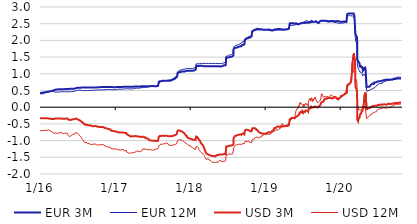
| Category | EUR 3M | EUR 12M | USD 3M | USD 12M |
|---|---|---|---|---|
| 2016-01-04 | 0.422 | 0.402 | -0.322 | -0.709 |
| 2016-01-05 | 0.423 | 0.401 | -0.327 | -0.713 |
| 2016-01-06 | 0.426 | 0.404 | -0.33 | -0.705 |
| 2016-01-07 | 0.432 | 0.409 | -0.327 | -0.687 |
| 2016-01-08 | 0.433 | 0.409 | -0.331 | -0.695 |
| 2016-01-11 | 0.433 | 0.4 | -0.332 | -0.704 |
| 2016-01-12 | 0.434 | 0.402 | -0.334 | -0.706 |
| 2016-01-13 | 0.434 | 0.401 | -0.332 | -0.713 |
| 2016-01-14 | 0.433 | 0.402 | -0.331 | -0.709 |
| 2016-01-15 | 0.432 | 0.401 | -0.33 | -0.695 |
| 2016-01-18 | 0.432 | 0.401 | -0.33 | -0.695 |
| 2016-01-19 | 0.432 | 0.401 | -0.33 | -0.695 |
| 2016-01-20 | 0.432 | 0.401 | -0.33 | -0.695 |
| 2016-01-21 | 0.432 | 0.401 | -0.33 | -0.695 |
| 2016-01-22 | 0.432 | 0.401 | -0.33 | -0.695 |
| 2016-01-25 | 0.445 | 0.422 | -0.331 | -0.703 |
| 2016-01-26 | 0.448 | 0.425 | -0.331 | -0.701 |
| 2016-01-27 | 0.449 | 0.428 | -0.328 | -0.7 |
| 2016-01-28 | 0.45 | 0.428 | -0.326 | -0.701 |
| 2016-01-29 | 0.452 | 0.435 | -0.323 | -0.69 |
| 2016-02-01 | 0.452 | 0.44 | -0.329 | -0.69 |
| 2016-02-02 | 0.451 | 0.441 | -0.329 | -0.688 |
| 2016-02-03 | 0.452 | 0.442 | -0.331 | -0.68 |
| 2016-02-04 | 0.456 | 0.448 | -0.33 | -0.679 |
| 2016-02-05 | 0.457 | 0.452 | -0.33 | -0.686 |
| 2016-02-08 | 0.459 | 0.455 | -0.331 | -0.69 |
| 2016-02-09 | 0.451 | 0.454 | -0.34 | -0.681 |
| 2016-02-10 | 0.455 | 0.451 | -0.338 | -0.684 |
| 2016-02-11 | 0.459 | 0.456 | -0.337 | -0.667 |
| 2016-02-12 | 0.463 | 0.459 | -0.338 | -0.666 |
| 2016-02-15 | 0.463 | 0.458 | -0.338 | -0.678 |
| 2016-02-16 | 0.467 | 0.462 | -0.338 | -0.682 |
| 2016-02-17 | 0.469 | 0.461 | -0.339 | -0.685 |
| 2016-02-18 | 0.475 | 0.464 | -0.338 | -0.692 |
| 2016-02-19 | 0.478 | 0.467 | -0.338 | -0.69 |
| 2016-02-22 | 0.479 | 0.468 | -0.345 | -0.709 |
| 2016-02-23 | 0.48 | 0.466 | -0.349 | -0.707 |
| 2016-02-24 | 0.481 | 0.465 | -0.355 | -0.705 |
| 2016-02-25 | 0.481 | 0.465 | -0.356 | -0.71 |
| 2016-02-26 | 0.482 | 0.467 | -0.355 | -0.711 |
| 2016-02-29 | 0.485 | 0.474 | -0.353 | -0.729 |
| 2016-03-01 | 0.487 | 0.476 | -0.352 | -0.729 |
| 2016-03-02 | 0.488 | 0.474 | -0.355 | -0.746 |
| 2016-03-03 | 0.493 | 0.475 | -0.356 | -0.75 |
| 2016-03-04 | 0.495 | 0.478 | -0.353 | -0.744 |
| 2016-03-07 | 0.496 | 0.474 | -0.356 | -0.762 |
| 2016-03-08 | 0.501 | 0.475 | -0.355 | -0.757 |
| 2016-03-09 | 0.504 | 0.473 | -0.355 | -0.759 |
| 2016-03-10 | 0.509 | 0.475 | -0.352 | -0.761 |
| 2016-03-11 | 0.515 | 0.459 | -0.344 | -0.774 |
| 2016-03-14 | 0.516 | 0.458 | -0.35 | -0.781 |
| 2016-03-15 | 0.517 | 0.456 | -0.352 | -0.787 |
| 2016-03-16 | 0.52 | 0.454 | -0.349 | -0.795 |
| 2016-03-17 | 0.524 | 0.453 | -0.333 | -0.752 |
| 2016-03-18 | 0.525 | 0.453 | -0.334 | -0.761 |
| 2016-03-21 | 0.528 | 0.452 | -0.335 | -0.764 |
| 2016-03-22 | 0.529 | 0.452 | -0.338 | -0.774 |
| 2016-03-23 | 0.531 | 0.453 | -0.34 | -0.787 |
| 2016-03-24 | 0.532 | 0.455 | -0.339 | -0.781 |
| 2016-03-29 | 0.532 | 0.456 | -0.341 | -0.789 |
| 2016-03-30 | 0.533 | 0.454 | -0.335 | -0.764 |
| 2016-03-31 | 0.534 | 0.455 | -0.339 | -0.76 |
| 2016-04-01 | 0.535 | 0.452 | -0.339 | -0.763 |
| 2016-04-04 | 0.536 | 0.451 | -0.34 | -0.772 |
| 2016-04-05 | 0.538 | 0.454 | -0.337 | -0.755 |
| 2016-04-06 | 0.538 | 0.455 | -0.341 | -0.762 |
| 2016-04-07 | 0.537 | 0.457 | -0.339 | -0.756 |
| 2016-04-08 | 0.538 | 0.46 | -0.341 | -0.755 |
| 2016-04-11 | 0.541 | 0.461 | -0.34 | -0.758 |
| 2016-04-12 | 0.539 | 0.462 | -0.34 | -0.759 |
| 2016-04-13 | 0.539 | 0.463 | -0.338 | -0.768 |
| 2016-04-14 | 0.541 | 0.461 | -0.343 | -0.771 |
| 2016-04-15 | 0.539 | 0.461 | -0.343 | -0.771 |
| 2016-04-18 | 0.539 | 0.462 | -0.344 | -0.768 |
| 2016-04-19 | 0.54 | 0.461 | -0.345 | -0.775 |
| 2016-04-20 | 0.54 | 0.461 | -0.345 | -0.775 |
| 2016-04-21 | 0.54 | 0.461 | -0.345 | -0.775 |
| 2016-04-22 | 0.54 | 0.461 | -0.345 | -0.775 |
| 2016-04-25 | 0.54 | 0.463 | -0.344 | -0.789 |
| 2016-04-26 | 0.542 | 0.464 | -0.344 | -0.793 |
| 2016-04-27 | 0.541 | 0.461 | -0.348 | -0.794 |
| 2016-04-28 | 0.542 | 0.462 | -0.347 | -0.78 |
| 2016-04-29 | 0.541 | 0.462 | -0.347 | -0.78 |
| 2016-05-02 | 0.54 | 0.462 | -0.347 | -0.78 |
| 2016-05-03 | 0.541 | 0.462 | -0.343 | -0.782 |
| 2016-05-04 | 0.543 | 0.462 | -0.344 | -0.78 |
| 2016-05-05 | 0.545 | 0.463 | -0.342 | -0.78 |
| 2016-05-06 | 0.546 | 0.463 | -0.34 | -0.774 |
| 2016-05-09 | 0.548 | 0.464 | -0.34 | -0.777 |
| 2016-05-10 | 0.55 | 0.463 | -0.338 | -0.774 |
| 2016-05-11 | 0.549 | 0.462 | -0.337 | -0.775 |
| 2016-05-12 | 0.548 | 0.462 | -0.336 | -0.777 |
| 2016-05-13 | 0.547 | 0.462 | -0.338 | -0.779 |
| 2016-05-16 | 0.547 | 0.462 | -0.336 | -0.783 |
| 2016-05-17 | 0.547 | 0.461 | -0.335 | -0.792 |
| 2016-05-18 | 0.547 | 0.461 | -0.346 | -0.82 |
| 2016-05-19 | 0.548 | 0.461 | -0.364 | -0.848 |
| 2016-05-20 | 0.548 | 0.461 | -0.371 | -0.852 |
| 2016-05-23 | 0.548 | 0.462 | -0.372 | -0.853 |
| 2016-05-24 | 0.548 | 0.462 | -0.375 | -0.862 |
| 2016-05-25 | 0.548 | 0.463 | -0.377 | -0.873 |
| 2016-05-26 | 0.548 | 0.464 | -0.384 | -0.871 |
| 2016-05-27 | 0.55 | 0.465 | -0.383 | -0.867 |
| 2016-05-30 | 0.551 | 0.465 | -0.383 | -0.867 |
| 2016-05-31 | 0.551 | 0.465 | -0.396 | -0.887 |
| 2016-06-01 | 0.551 | 0.468 | -0.391 | -0.878 |
| 2016-06-02 | 0.552 | 0.467 | -0.39 | -0.882 |
| 2016-06-03 | 0.551 | 0.466 | -0.392 | -0.881 |
| 2016-06-06 | 0.552 | 0.468 | -0.371 | -0.836 |
| 2016-06-07 | 0.551 | 0.468 | -0.367 | -0.835 |
| 2016-06-08 | 0.554 | 0.468 | -0.368 | -0.828 |
| 2016-06-09 | 0.552 | 0.468 | -0.366 | -0.824 |
| 2016-06-10 | 0.553 | 0.468 | -0.366 | -0.824 |
| 2016-06-13 | 0.553 | 0.47 | -0.362 | -0.809 |
| 2016-06-14 | 0.552 | 0.471 | -0.365 | -0.803 |
| 2016-06-15 | 0.552 | 0.471 | -0.366 | -0.815 |
| 2016-06-16 | 0.554 | 0.476 | -0.357 | -0.788 |
| 2016-06-17 | 0.555 | 0.476 | -0.354 | -0.791 |
| 2016-06-20 | 0.556 | 0.478 | -0.356 | -0.802 |
| 2016-06-21 | 0.556 | 0.479 | -0.352 | -0.802 |
| 2016-06-22 | 0.558 | 0.479 | -0.35 | -0.801 |
| 2016-06-23 | 0.559 | 0.479 | -0.35 | -0.8 |
| 2016-06-24 | 0.571 | 0.497 | -0.334 | -0.755 |
| 2016-06-27 | 0.573 | 0.498 | -0.337 | -0.746 |
| 2016-06-28 | 0.571 | 0.499 | -0.341 | -0.755 |
| 2016-06-29 | 0.572 | 0.501 | -0.356 | -0.766 |
| 2016-06-30 | 0.576 | 0.501 | -0.364 | -0.78 |
| 2016-07-01 | 0.58 | 0.502 | -0.363 | -0.775 |
| 2016-07-04 | 0.581 | 0.505 | -0.366 | -0.785 |
| 2016-07-07 | 0.583 | 0.513 | -0.375 | -0.796 |
| 2016-07-08 | 0.583 | 0.509 | -0.377 | -0.803 |
| 2016-07-11 | 0.582 | 0.513 | -0.379 | -0.82 |
| 2016-07-12 | 0.581 | 0.511 | -0.383 | -0.834 |
| 2016-07-13 | 0.585 | 0.511 | -0.39 | -0.843 |
| 2016-07-14 | 0.585 | 0.511 | -0.389 | -0.848 |
| 2016-07-15 | 0.583 | 0.507 | -0.398 | -0.858 |
| 2016-07-18 | 0.585 | 0.511 | -0.406 | -0.876 |
| 2016-07-19 | 0.585 | 0.509 | -0.407 | -0.879 |
| 2016-07-20 | 0.585 | 0.509 | -0.407 | -0.879 |
| 2016-07-21 | 0.585 | 0.509 | -0.407 | -0.879 |
| 2016-07-22 | 0.585 | 0.509 | -0.407 | -0.879 |
| 2016-07-25 | 0.587 | 0.499 | -0.444 | -0.936 |
| 2016-07-26 | 0.588 | 0.498 | -0.453 | -0.949 |
| 2016-07-27 | 0.588 | 0.499 | -0.461 | -0.964 |
| 2016-07-28 | 0.586 | 0.499 | -0.466 | -0.97 |
| 2016-07-29 | 0.587 | 0.499 | -0.469 | -0.982 |
| 2016-08-01 | 0.587 | 0.498 | -0.469 | -0.984 |
| 2016-08-02 | 0.588 | 0.498 | -0.478 | -0.993 |
| 2016-08-03 | 0.589 | 0.497 | -0.488 | -1.005 |
| 2016-08-04 | 0.588 | 0.495 | -0.498 | -1.027 |
| 2016-08-05 | 0.588 | 0.497 | -0.502 | -1.025 |
| 2016-08-08 | 0.588 | 0.496 | -0.516 | -1.058 |
| 2016-08-09 | 0.588 | 0.497 | -0.526 | -1.072 |
| 2016-08-10 | 0.587 | 0.498 | -0.528 | -1.074 |
| 2016-08-11 | 0.589 | 0.499 | -0.527 | -1.07 |
| 2016-08-12 | 0.589 | 0.499 | -0.528 | -1.076 |
| 2016-08-15 | 0.588 | 0.5 | -0.514 | -1.057 |
| 2016-08-16 | 0.589 | 0.5 | -0.511 | -1.048 |
| 2016-08-17 | 0.588 | 0.499 | -0.521 | -1.07 |
| 2016-08-18 | 0.589 | 0.498 | -0.521 | -1.065 |
| 2016-08-19 | 0.588 | 0.497 | -0.527 | -1.073 |
| 2016-08-22 | 0.589 | 0.496 | -0.535 | -1.083 |
| 2016-08-23 | 0.588 | 0.497 | -0.535 | -1.081 |
| 2016-08-24 | 0.588 | 0.498 | -0.535 | -1.077 |
| 2016-08-25 | 0.588 | 0.499 | -0.539 | -1.076 |
| 2016-08-26 | 0.588 | 0.5 | -0.543 | -1.087 |
| 2016-08-29 | 0.587 | 0.5 | -0.543 | -1.087 |
| 2016-08-30 | 0.589 | 0.501 | -0.552 | -1.109 |
| 2016-08-31 | 0.589 | 0.502 | -0.549 | -1.107 |
| 2016-09-01 | 0.589 | 0.501 | -0.546 | -1.116 |
| 2016-09-02 | 0.591 | 0.502 | -0.545 | -1.109 |
| 2016-09-05 | 0.591 | 0.502 | -0.543 | -1.112 |
| 2016-09-06 | 0.593 | 0.504 | -0.551 | -1.111 |
| 2016-09-07 | 0.593 | 0.509 | -0.544 | -1.089 |
| 2016-09-08 | 0.594 | 0.51 | -0.555 | -1.09 |
| 2016-09-09 | 0.591 | 0.507 | -0.562 | -1.107 |
| 2016-09-12 | 0.593 | 0.507 | -0.566 | -1.116 |
| 2016-09-13 | 0.592 | 0.505 | -0.56 | -1.104 |
| 2016-09-14 | 0.593 | 0.504 | -0.564 | -1.106 |
| 2016-09-15 | 0.591 | 0.503 | -0.567 | -1.1 |
| 2016-09-16 | 0.591 | 0.504 | -0.567 | -1.095 |
| 2016-09-19 | 0.591 | 0.506 | -0.571 | -1.106 |
| 2016-09-20 | 0.591 | 0.507 | -0.576 | -1.115 |
| 2016-09-21 | 0.591 | 0.508 | -0.573 | -1.121 |
| 2016-09-22 | 0.591 | 0.509 | -0.567 | -1.111 |
| 2016-09-23 | 0.592 | 0.509 | -0.563 | -1.107 |
| 2016-09-26 | 0.593 | 0.51 | -0.563 | -1.105 |
| 2016-09-27 | 0.591 | 0.51 | -0.564 | -1.101 |
| 2016-09-29 | 0.591 | 0.514 | -0.556 | -1.106 |
| 2016-09-30 | 0.591 | 0.514 | -0.564 | -1.102 |
| 2016-10-03 | 0.591 | 0.514 | -0.568 | -1.109 |
| 2016-10-04 | 0.591 | 0.514 | -0.574 | -1.116 |
| 2016-10-05 | 0.592 | 0.514 | -0.578 | -1.123 |
| 2016-10-06 | 0.594 | 0.514 | -0.582 | -1.131 |
| 2016-10-07 | 0.594 | 0.513 | -0.586 | -1.137 |
| 2016-10-10 | 0.595 | 0.514 | -0.584 | -1.136 |
| 2016-10-11 | 0.596 | 0.516 | -0.587 | -1.141 |
| 2016-10-12 | 0.599 | 0.519 | -0.591 | -1.146 |
| 2016-10-13 | 0.601 | 0.521 | -0.59 | -1.137 |
| 2016-10-14 | 0.601 | 0.522 | -0.592 | -1.136 |
| 2016-10-17 | 0.601 | 0.521 | -0.588 | -1.131 |
| 2016-10-18 | 0.602 | 0.523 | -0.591 | -1.121 |
| 2016-10-19 | 0.603 | 0.523 | -0.591 | -1.114 |
| 2016-10-20 | 0.603 | 0.523 | -0.592 | -1.116 |
| 2016-10-21 | 0.602 | 0.524 | -0.592 | -1.122 |
| 2016-10-24 | 0.601 | 0.52 | -0.594 | -1.121 |
| 2016-10-25 | 0.602 | 0.521 | -0.596 | -1.128 |
| 2016-10-26 | 0.603 | 0.52 | -0.6 | -1.13 |
| 2016-10-27 | 0.602 | 0.52 | -0.597 | -1.132 |
| 2016-10-31 | 0.603 | 0.519 | -0.594 | -1.125 |
| 2016-11-01 | 0.603 | 0.519 | -0.591 | -1.126 |
| 2016-11-02 | 0.603 | 0.521 | -0.586 | -1.115 |
| 2016-11-03 | 0.603 | 0.521 | -0.591 | -1.11 |
| 2016-11-04 | 0.602 | 0.521 | -0.593 | -1.109 |
| 2016-11-07 | 0.602 | 0.52 | -0.597 | -1.118 |
| 2016-11-08 | 0.602 | 0.52 | -0.592 | -1.118 |
| 2016-11-09 | 0.602 | 0.52 | -0.596 | -1.106 |
| 2016-11-10 | 0.602 | 0.521 | -0.612 | -1.133 |
| 2016-11-11 | 0.602 | 0.519 | -0.616 | -1.138 |
| 2016-11-14 | 0.602 | 0.52 | -0.621 | -1.16 |
| 2016-11-15 | 0.602 | 0.521 | -0.616 | -1.155 |
| 2016-11-16 | 0.601 | 0.523 | -0.619 | -1.162 |
| 2016-11-18 | 0.603 | 0.527 | -0.626 | -1.171 |
| 2016-11-21 | 0.602 | 0.528 | -0.63 | -1.173 |
| 2016-11-22 | 0.603 | 0.529 | -0.635 | -1.178 |
| 2016-11-23 | 0.603 | 0.528 | -0.64 | -1.18 |
| 2016-11-24 | 0.604 | 0.529 | -0.647 | -1.193 |
| 2016-11-25 | 0.604 | 0.529 | -0.647 | -1.195 |
| 2016-11-28 | 0.604 | 0.529 | -0.645 | -1.191 |
| 2016-11-29 | 0.604 | 0.529 | -0.641 | -1.191 |
| 2016-11-30 | 0.604 | 0.53 | -0.644 | -1.189 |
| 2016-12-01 | 0.603 | 0.529 | -0.652 | -1.193 |
| 2016-12-02 | 0.603 | 0.526 | -0.656 | -1.195 |
| 2016-12-05 | 0.603 | 0.528 | -0.658 | -1.194 |
| 2016-12-06 | 0.605 | 0.529 | -0.661 | -1.196 |
| 2016-12-07 | 0.606 | 0.528 | -0.661 | -1.195 |
| 2016-12-08 | 0.608 | 0.528 | -0.663 | -1.195 |
| 2016-12-09 | 0.606 | 0.531 | -0.667 | -1.198 |
| 2016-12-12 | 0.606 | 0.531 | -0.669 | -1.205 |
| 2016-12-13 | 0.606 | 0.531 | -0.673 | -1.204 |
| 2016-12-14 | 0.606 | 0.532 | -0.68 | -1.205 |
| 2016-12-15 | 0.606 | 0.531 | -0.703 | -1.25 |
| 2016-12-16 | 0.604 | 0.531 | -0.707 | -1.243 |
| 2016-12-19 | 0.603 | 0.521 | -0.704 | -1.252 |
| 2016-12-20 | 0.603 | 0.521 | -0.706 | -1.251 |
| 2016-12-21 | 0.605 | 0.522 | -0.708 | -1.25 |
| 2016-12-22 | 0.596 | 0.522 | -0.717 | -1.248 |
| 2016-12-23 | 0.597 | 0.522 | -0.717 | -1.25 |
| 2016-12-27 | 0.598 | 0.521 | -0.717 | -1.25 |
| 2016-12-28 | 0.589 | 0.512 | -0.728 | -1.26 |
| 2016-12-29 | 0.599 | 0.521 | -0.718 | -1.247 |
| 2016-12-30 | 0.599 | 0.522 | -0.718 | -1.246 |
| 2017-01-02 | 0.598 | 0.523 | -0.718 | -1.246 |
| 2017-01-03 | 0.599 | 0.524 | -0.719 | -1.249 |
| 2017-01-04 | 0.6 | 0.525 | -0.725 | -1.249 |
| 2017-01-05 | 0.601 | 0.525 | -0.729 | -1.249 |
| 2017-01-06 | 0.601 | 0.527 | -0.73 | -1.245 |
| 2017-01-09 | 0.602 | 0.528 | -0.735 | -1.261 |
| 2017-01-10 | 0.604 | 0.53 | -0.738 | -1.262 |
| 2017-01-11 | 0.606 | 0.531 | -0.742 | -1.263 |
| 2017-01-12 | 0.607 | 0.533 | -0.742 | -1.258 |
| 2017-01-13 | 0.607 | 0.534 | -0.743 | -1.258 |
| 2017-01-16 | 0.608 | 0.535 | -0.744 | -1.262 |
| 2017-01-17 | 0.609 | 0.538 | -0.745 | -1.262 |
| 2017-01-18 | 0.609 | 0.539 | -0.75 | -1.27 |
| 2017-01-19 | 0.609 | 0.54 | -0.761 | -1.288 |
| 2017-01-20 | 0.609 | 0.54 | -0.761 | -1.288 |
| 2017-01-23 | 0.607 | 0.541 | -0.758 | -1.281 |
| 2017-01-24 | 0.608 | 0.541 | -0.752 | -1.267 |
| 2017-01-25 | 0.608 | 0.541 | -0.757 | -1.279 |
| 2017-01-26 | 0.608 | 0.542 | -0.759 | -1.288 |
| 2017-01-27 | 0.608 | 0.541 | -0.759 | -1.284 |
| 2017-01-30 | 0.608 | 0.54 | -0.754 | -1.285 |
| 2017-01-31 | 0.607 | 0.541 | -0.755 | -1.273 |
| 2017-02-01 | 0.608 | 0.543 | -0.755 | -1.275 |
| 2017-02-02 | 0.608 | 0.542 | -0.754 | -1.272 |
| 2017-02-03 | 0.608 | 0.541 | -0.754 | -1.273 |
| 2017-02-06 | 0.608 | 0.541 | -0.758 | -1.267 |
| 2017-02-07 | 0.608 | 0.541 | -0.758 | -1.265 |
| 2017-02-08 | 0.608 | 0.541 | -0.754 | -1.26 |
| 2017-02-09 | 0.608 | 0.541 | -0.754 | -1.254 |
| 2017-02-10 | 0.609 | 0.541 | -0.756 | -1.263 |
| 2017-02-13 | 0.609 | 0.542 | -0.759 | -1.27 |
| 2017-02-14 | 0.608 | 0.544 | -0.757 | -1.268 |
| 2017-02-15 | 0.608 | 0.544 | -0.762 | -1.284 |
| 2017-02-16 | 0.608 | 0.546 | -0.776 | -1.305 |
| 2017-02-17 | 0.609 | 0.549 | -0.772 | -1.295 |
| 2017-02-20 | 0.609 | 0.549 | -0.77 | -1.295 |
| 2017-02-21 | 0.609 | 0.551 | -0.773 | -1.305 |
| 2017-02-22 | 0.61 | 0.551 | -0.774 | -1.306 |
| 2017-02-23 | 0.609 | 0.551 | -0.772 | -1.304 |
| 2017-02-24 | 0.609 | 0.553 | -0.774 | -1.3 |
| 2017-02-27 | 0.609 | 0.553 | -0.775 | -1.3 |
| 2017-02-28 | 0.61 | 0.554 | -0.784 | -1.316 |
| 2017-03-01 | 0.609 | 0.554 | -0.813 | -1.35 |
| 2017-03-02 | 0.609 | 0.554 | -0.82 | -1.358 |
| 2017-03-03 | 0.609 | 0.553 | -0.822 | -1.368 |
| 2017-03-06 | 0.609 | 0.551 | -0.826 | -1.36 |
| 2017-03-07 | 0.608 | 0.551 | -0.826 | -1.36 |
| 2017-03-08 | 0.609 | 0.551 | -0.829 | -1.361 |
| 2017-03-09 | 0.609 | 0.551 | -0.84 | -1.374 |
| 2017-03-10 | 0.609 | 0.549 | -0.841 | -1.378 |
| 2017-03-13 | 0.61 | 0.548 | -0.851 | -1.381 |
| 2017-03-14 | 0.61 | 0.548 | -0.857 | -1.383 |
| 2017-03-15 | 0.609 | 0.55 | -0.868 | -1.388 |
| 2017-03-16 | 0.609 | 0.551 | -0.872 | -1.374 |
| 2017-03-17 | 0.609 | 0.549 | -0.872 | -1.373 |
| 2017-03-20 | 0.609 | 0.549 | -0.876 | -1.376 |
| 2017-03-21 | 0.609 | 0.546 | -0.876 | -1.375 |
| 2017-03-22 | 0.61 | 0.546 | -0.877 | -1.367 |
| 2017-03-23 | 0.61 | 0.547 | -0.873 | -1.364 |
| 2017-03-24 | 0.61 | 0.547 | -0.871 | -1.363 |
| 2017-03-27 | 0.61 | 0.549 | -0.872 | -1.357 |
| 2017-03-28 | 0.61 | 0.55 | -0.872 | -1.358 |
| 2017-03-29 | 0.61 | 0.549 | -0.867 | -1.354 |
| 2017-03-30 | 0.61 | 0.549 | -0.868 | -1.353 |
| 2017-03-31 | 0.609 | 0.549 | -0.87 | -1.362 |
| 2017-04-03 | 0.61 | 0.551 | -0.87 | -1.363 |
| 2017-04-04 | 0.61 | 0.551 | -0.87 | -1.352 |
| 2017-04-05 | 0.609 | 0.554 | -0.87 | -1.356 |
| 2017-04-06 | 0.61 | 0.555 | -0.875 | -1.358 |
| 2017-04-07 | 0.62 | 0.556 | -0.868 | -1.359 |
| 2017-04-10 | 0.622 | 0.568 | -0.866 | -1.348 |
| 2017-04-11 | 0.622 | 0.569 | -0.865 | -1.339 |
| 2017-04-12 | 0.622 | 0.57 | -0.868 | -1.333 |
| 2017-04-13 | 0.621 | 0.57 | -0.868 | -1.322 |
| 2017-04-18 | 0.621 | 0.572 | -0.866 | -1.311 |
| 2017-04-19 | 0.622 | 0.573 | -0.866 | -1.286 |
| 2017-04-20 | 0.622 | 0.574 | -0.863 | -1.289 |
| 2017-04-21 | 0.621 | 0.574 | -0.866 | -1.295 |
| 2017-04-24 | 0.619 | 0.571 | -0.876 | -1.318 |
| 2017-04-25 | 0.619 | 0.571 | -0.88 | -1.325 |
| 2017-04-26 | 0.619 | 0.571 | -0.882 | -1.333 |
| 2017-04-27 | 0.619 | 0.571 | -0.88 | -1.326 |
| 2017-04-28 | 0.619 | 0.571 | -0.882 | -1.324 |
| 2017-05-02 | 0.619 | 0.571 | -0.884 | -1.33 |
| 2017-05-03 | 0.619 | 0.575 | -0.881 | -1.32 |
| 2017-05-04 | 0.619 | 0.576 | -0.889 | -1.331 |
| 2017-05-05 | 0.619 | 0.574 | -0.89 | -1.329 |
| 2017-05-09 | 0.619 | 0.583 | -0.892 | -1.331 |
| 2017-05-10 | 0.619 | 0.584 | -0.891 | -1.328 |
| 2017-05-11 | 0.629 | 0.584 | -0.882 | -1.326 |
| 2017-05-12 | 0.629 | 0.587 | -0.88 | -1.306 |
| 2017-05-15 | 0.63 | 0.587 | -0.879 | -1.285 |
| 2017-05-16 | 0.631 | 0.588 | -0.881 | -1.285 |
| 2017-05-17 | 0.631 | 0.589 | -0.878 | -1.273 |
| 2017-05-18 | 0.631 | 0.589 | -0.872 | -1.245 |
| 2017-05-19 | 0.631 | 0.589 | -0.886 | -1.263 |
| 2017-05-22 | 0.629 | 0.589 | -0.892 | -1.266 |
| 2017-05-23 | 0.63 | 0.589 | -0.889 | -1.26 |
| 2017-05-24 | 0.629 | 0.599 | -0.898 | -1.256 |
| 2017-05-25 | 0.629 | 0.599 | -0.9 | -1.253 |
| 2017-05-26 | 0.629 | 0.6 | -0.902 | -1.251 |
| 2017-05-29 | 0.629 | 0.601 | -0.902 | -1.251 |
| 2017-05-30 | 0.629 | 0.591 | -0.902 | -1.262 |
| 2017-05-31 | 0.629 | 0.591 | -0.91 | -1.264 |
| 2017-06-01 | 0.629 | 0.591 | -0.918 | -1.266 |
| 2017-06-02 | 0.619 | 0.591 | -0.932 | -1.271 |
| 2017-06-05 | 0.619 | 0.591 | -0.93 | -1.266 |
| 2017-06-06 | 0.619 | 0.593 | -0.929 | -1.263 |
| 2017-06-07 | 0.619 | 0.594 | -0.931 | -1.264 |
| 2017-06-08 | 0.62 | 0.594 | -0.938 | -1.268 |
| 2017-06-09 | 0.631 | 0.6 | -0.936 | -1.268 |
| 2017-06-12 | 0.631 | 0.607 | -0.942 | -1.276 |
| 2017-06-13 | 0.631 | 0.609 | -0.946 | -1.276 |
| 2017-06-14 | 0.631 | 0.612 | -0.95 | -1.276 |
| 2017-06-15 | 0.629 | 0.612 | -0.967 | -1.27 |
| 2017-06-16 | 0.629 | 0.614 | -0.974 | -1.272 |
| 2017-06-19 | 0.629 | 0.616 | -0.98 | -1.268 |
| 2017-06-20 | 0.629 | 0.619 | -0.987 | -1.276 |
| 2017-06-21 | 0.629 | 0.621 | -0.989 | -1.275 |
| 2017-06-22 | 0.63 | 0.621 | -0.996 | -1.278 |
| 2017-06-23 | 0.631 | 0.623 | -0.993 | -1.273 |
| 2017-06-26 | 0.631 | 0.621 | -0.995 | -1.275 |
| 2017-06-27 | 0.631 | 0.621 | -0.995 | -1.273 |
| 2017-06-28 | 0.631 | 0.618 | -0.996 | -1.277 |
| 2017-06-29 | 0.621 | 0.616 | -1.009 | -1.28 |
| 2017-06-30 | 0.631 | 0.616 | -0.999 | -1.278 |
| 2017-07-03 | 0.631 | 0.617 | -1.001 | -1.288 |
| 2017-07-04 | 0.629 | 0.619 | -1.002 | -1.291 |
| 2017-07-07 | 0.631 | 0.631 | -1.005 | -1.288 |
| 2017-07-10 | 0.631 | 0.626 | -1.004 | -1.281 |
| 2017-07-11 | 0.631 | 0.625 | -1.004 | -1.282 |
| 2017-07-12 | 0.631 | 0.624 | -1.004 | -1.276 |
| 2017-07-13 | 0.631 | 0.621 | -1.004 | -1.268 |
| 2017-07-14 | 0.631 | 0.621 | -1.004 | -1.27 |
| 2017-07-17 | 0.63 | 0.621 | -1.006 | -1.263 |
| 2017-07-18 | 0.631 | 0.621 | -1.007 | -1.263 |
| 2017-07-19 | 0.632 | 0.621 | -1.007 | -1.263 |
| 2017-07-20 | 0.632 | 0.621 | -1.007 | -1.263 |
| 2017-07-21 | 0.632 | 0.621 | -1.007 | -1.263 |
| 2017-07-24 | 0.629 | 0.633 | -1.014 | -1.256 |
| 2017-07-25 | 0.629 | 0.633 | -1.017 | -1.259 |
| 2017-07-26 | 0.63 | 0.633 | -1.014 | -1.256 |
| 2017-07-27 | 0.629 | 0.633 | -1.011 | -1.25 |
| 2017-07-28 | 0.639 | 0.632 | -1.001 | -1.249 |
| 2017-07-31 | 0.64 | 0.641 | -1.001 | -1.237 |
| 2017-08-01 | 0.641 | 0.641 | -1.001 | -1.236 |
| 2017-08-02 | 0.641 | 0.643 | -1.003 | -1.236 |
| 2017-08-03 | 0.639 | 0.642 | -1.002 | -1.236 |
| 2017-08-04 | 0.759 | 0.711 | -0.882 | -1.163 |
| 2017-08-07 | 0.768 | 0.742 | -0.871 | -1.142 |
| 2017-08-08 | 0.768 | 0.752 | -0.869 | -1.13 |
| 2017-08-09 | 0.778 | 0.753 | -0.859 | -1.128 |
| 2017-08-10 | 0.779 | 0.764 | -0.859 | -1.118 |
| 2017-08-11 | 0.779 | 0.766 | -0.865 | -1.115 |
| 2017-08-14 | 0.779 | 0.768 | -0.864 | -1.108 |
| 2017-08-15 | 0.779 | 0.767 | -0.864 | -1.118 |
| 2017-08-16 | 0.779 | 0.777 | -0.867 | -1.116 |
| 2017-08-17 | 0.789 | 0.778 | -0.856 | -1.113 |
| 2017-08-18 | 0.789 | 0.778 | -0.855 | -1.106 |
| 2017-08-21 | 0.789 | 0.778 | -0.854 | -1.107 |
| 2017-08-22 | 0.788 | 0.788 | -0.857 | -1.097 |
| 2017-08-23 | 0.789 | 0.789 | -0.857 | -1.098 |
| 2017-08-24 | 0.789 | 0.789 | -0.857 | -1.093 |
| 2017-08-25 | 0.789 | 0.789 | -0.858 | -1.098 |
| 2017-08-28 | 0.789 | 0.789 | -0.858 | -1.098 |
| 2017-08-29 | 0.79 | 0.79 | -0.857 | -1.084 |
| 2017-08-30 | 0.79 | 0.791 | -0.856 | -1.082 |
| 2017-08-31 | 0.789 | 0.791 | -0.858 | -1.083 |
| 2017-09-01 | 0.789 | 0.791 | -0.856 | -1.082 |
| 2017-09-04 | 0.789 | 0.791 | -0.856 | -1.083 |
| 2017-09-05 | 0.789 | 0.791 | -0.857 | -1.085 |
| 2017-09-06 | 0.789 | 0.793 | -0.857 | -1.078 |
| 2017-09-07 | 0.79 | 0.792 | -0.857 | -1.079 |
| 2017-09-08 | 0.791 | 0.796 | -0.85 | -1.065 |
| 2017-09-11 | 0.791 | 0.798 | -0.857 | -1.069 |
| 2017-09-12 | 0.79 | 0.809 | -0.859 | -1.07 |
| 2017-09-13 | 0.789 | 0.809 | -0.86 | -1.072 |
| 2017-09-14 | 0.789 | 0.811 | -0.861 | -1.08 |
| 2017-09-15 | 0.789 | 0.811 | -0.864 | -1.092 |
| 2017-09-18 | 0.789 | 0.811 | -0.865 | -1.1 |
| 2017-09-19 | 0.79 | 0.811 | -0.866 | -1.104 |
| 2017-09-20 | 0.789 | 0.811 | -0.863 | -1.107 |
| 2017-09-21 | 0.79 | 0.811 | -0.868 | -1.128 |
| 2017-09-22 | 0.789 | 0.811 | -0.869 | -1.135 |
| 2017-09-25 | 0.789 | 0.811 | -0.87 | -1.135 |
| 2017-09-26 | 0.789 | 0.811 | -0.871 | -1.136 |
| 2017-09-27 | 0.799 | 0.811 | -0.863 | -1.145 |
| 2017-09-29 | 0.799 | 0.822 | -0.864 | -1.132 |
| 2017-10-02 | 0.799 | 0.822 | -0.866 | -1.141 |
| 2017-10-03 | 0.8 | 0.821 | -0.872 | -1.149 |
| 2017-10-04 | 0.799 | 0.818 | -0.877 | -1.148 |
| 2017-10-05 | 0.809 | 0.831 | -0.869 | -1.14 |
| 2017-10-06 | 0.819 | 0.833 | -0.86 | -1.145 |
| 2017-10-09 | 0.819 | 0.846 | -0.866 | -1.139 |
| 2017-10-10 | 0.819 | 0.851 | -0.867 | -1.137 |
| 2017-10-11 | 0.819 | 0.841 | -0.869 | -1.15 |
| 2017-10-12 | 0.819 | 0.841 | -0.869 | -1.148 |
| 2017-10-13 | 0.829 | 0.851 | -0.853 | -1.143 |
| 2017-10-16 | 0.839 | 0.862 | -0.844 | -1.13 |
| 2017-10-17 | 0.839 | 0.873 | -0.847 | -1.131 |
| 2017-10-18 | 0.849 | 0.883 | -0.843 | -1.135 |
| 2017-10-19 | 0.849 | 0.893 | -0.842 | -1.118 |
| 2017-10-20 | 0.849 | 0.893 | -0.842 | -1.118 |
| 2017-10-23 | 0.859 | 0.903 | -0.837 | -1.115 |
| 2017-10-24 | 0.87 | 0.903 | -0.831 | -1.115 |
| 2017-10-25 | 0.871 | 0.913 | -0.834 | -1.115 |
| 2017-10-26 | 0.881 | 0.923 | -0.828 | -1.103 |
| 2017-10-27 | 0.891 | 0.924 | -0.82 | -1.108 |
| 2017-10-30 | 0.901 | 0.935 | -0.807 | -1.092 |
| 2017-10-31 | 0.911 | 0.955 | -0.801 | -1.078 |
| 2017-11-01 | 0.919 | 0.957 | -0.795 | -1.086 |
| 2017-11-02 | 0.939 | 0.979 | -0.781 | -1.073 |
| 2017-11-03 | 1.019 | 1.061 | -0.702 | -0.993 |
| 2017-11-06 | 1.029 | 1.081 | -0.697 | -0.974 |
| 2017-11-07 | 1.029 | 1.08 | -0.703 | -0.978 |
| 2017-11-08 | 1.039 | 1.081 | -0.7 | -0.983 |
| 2017-11-09 | 1.049 | 1.091 | -0.693 | -0.982 |
| 2017-11-10 | 1.049 | 1.101 | -0.693 | -0.971 |
| 2017-11-13 | 1.049 | 1.101 | -0.696 | -0.974 |
| 2017-11-14 | 1.049 | 1.111 | -0.699 | -0.973 |
| 2017-11-15 | 1.049 | 1.112 | -0.702 | -0.966 |
| 2017-11-16 | 1.049 | 1.122 | -0.716 | -0.971 |
| 2017-11-20 | 1.059 | 1.117 | -0.716 | -0.978 |
| 2017-11-21 | 1.059 | 1.126 | -0.724 | -0.987 |
| 2017-11-22 | 1.059 | 1.126 | -0.732 | -0.994 |
| 2017-11-23 | 1.059 | 1.126 | -0.732 | -0.99 |
| 2017-11-24 | 1.069 | 1.126 | -0.728 | -0.996 |
| 2017-11-27 | 1.069 | 1.126 | -0.737 | -1.003 |
| 2017-11-28 | 1.069 | 1.126 | -0.739 | -0.998 |
| 2017-11-29 | 1.069 | 1.137 | -0.741 | -0.995 |
| 2017-11-30 | 1.069 | 1.138 | -0.747 | -1.002 |
| 2017-12-01 | 1.066 | 1.128 | -0.755 | -1.02 |
| 2017-12-04 | 1.066 | 1.14 | -0.768 | -1.032 |
| 2017-12-05 | 1.066 | 1.141 | -0.775 | -1.04 |
| 2017-12-06 | 1.066 | 1.141 | -0.783 | -1.038 |
| 2017-12-07 | 1.065 | 1.14 | -0.796 | -1.047 |
| 2017-12-08 | 1.076 | 1.141 | -0.799 | -1.061 |
| 2017-12-11 | 1.077 | 1.141 | -0.813 | -1.064 |
| 2017-12-12 | 1.077 | 1.141 | -0.824 | -1.078 |
| 2017-12-13 | 1.079 | 1.151 | -0.838 | -1.079 |
| 2017-12-14 | 1.091 | 1.162 | -0.84 | -1.069 |
| 2017-12-15 | 1.089 | 1.163 | -0.853 | -1.078 |
| 2017-12-18 | 1.089 | 1.164 | -0.865 | -1.088 |
| 2017-12-19 | 1.089 | 1.164 | -0.882 | -1.099 |
| 2017-12-20 | 1.089 | 1.158 | -0.898 | -1.114 |
| 2017-12-21 | 1.089 | 1.156 | -0.915 | -1.121 |
| 2017-12-22 | 1.089 | 1.156 | -0.926 | -1.132 |
| 2017-12-27 | 1.089 | 1.156 | -0.933 | -1.141 |
| 2017-12-28 | 1.089 | 1.156 | -0.935 | -1.136 |
| 2017-12-29 | 1.089 | 1.156 | -0.934 | -1.137 |
| 2018-01-02 | 1.089 | 1.156 | -0.937 | -1.139 |
| 2018-01-03 | 1.089 | 1.157 | -0.936 | -1.148 |
| 2018-01-04 | 1.089 | 1.157 | -0.944 | -1.168 |
| 2018-01-05 | 1.089 | 1.157 | -0.944 | -1.18 |
| 2018-01-08 | 1.089 | 1.157 | -0.948 | -1.181 |
| 2018-01-09 | 1.089 | 1.157 | -0.945 | -1.176 |
| 2018-01-10 | 1.089 | 1.156 | -0.949 | -1.186 |
| 2018-01-11 | 1.109 | 1.178 | -0.94 | -1.174 |
| 2018-01-12 | 1.089 | 1.156 | -0.962 | -1.203 |
| 2018-01-15 | 1.089 | 1.157 | -0.971 | -1.219 |
| 2018-01-16 | 1.089 | 1.156 | -0.974 | -1.226 |
| 2018-01-17 | 1.098 | 1.166 | -0.969 | -1.234 |
| 2018-01-18 | 1.098 | 1.171 | -0.975 | -1.248 |
| 2018-01-19 | 1.098 | 1.171 | -0.974 | -1.248 |
| 2018-01-22 | 1.098 | 1.171 | -0.971 | -1.248 |
| 2018-01-23 | 1.098 | 1.171 | -0.975 | -1.245 |
| 2018-01-24 | 1.098 | 1.172 | -0.982 | -1.251 |
| 2018-01-25 | 1.108 | 1.182 | -0.972 | -1.241 |
| 2018-01-26 | 1.108 | 1.182 | -0.972 | -1.241 |
| 2018-01-29 | 1.118 | 1.191 | -0.982 | -1.264 |
| 2018-01-30 | 1.138 | 1.201 | -0.963 | -1.253 |
| 2018-01-31 | 1.138 | 1.211 | -0.968 | -1.247 |
| 2018-02-01 | 1.158 | 1.221 | -0.957 | -1.263 |
| 2018-02-02 | 1.239 | 1.301 | -0.879 | -1.181 |
| 2018-02-05 | 1.239 | 1.301 | -0.883 | -1.183 |
| 2018-02-06 | 1.239 | 1.301 | -0.881 | -1.168 |
| 2018-02-07 | 1.239 | 1.301 | -0.89 | -1.176 |
| 2018-02-08 | 1.239 | 1.301 | -0.9 | -1.188 |
| 2018-02-09 | 1.229 | 1.301 | -0.92 | -1.203 |
| 2018-02-12 | 1.229 | 1.301 | -0.933 | -1.209 |
| 2018-02-13 | 1.229 | 1.301 | -0.939 | -1.217 |
| 2018-02-14 | 1.228 | 1.302 | -0.95 | -1.228 |
| 2018-02-15 | 1.228 | 1.301 | -0.972 | -1.271 |
| 2018-02-16 | 1.228 | 1.302 | -0.985 | -1.281 |
| 2018-02-19 | 1.239 | 1.303 | -0.982 | -1.288 |
| 2018-02-20 | 1.239 | 1.303 | -0.994 | -1.298 |
| 2018-02-21 | 1.239 | 1.301 | -1.01 | -1.316 |
| 2018-02-22 | 1.238 | 1.311 | -1.034 | -1.33 |
| 2018-02-23 | 1.238 | 1.311 | -1.046 | -1.34 |
| 2018-02-26 | 1.238 | 1.31 | -1.074 | -1.349 |
| 2018-02-27 | 1.238 | 1.311 | -1.096 | -1.361 |
| 2018-02-28 | 1.237 | 1.311 | -1.107 | -1.382 |
| 2018-03-01 | 1.237 | 1.311 | -1.115 | -1.387 |
| 2018-03-02 | 1.237 | 1.311 | -1.115 | -1.377 |
| 2018-03-05 | 1.237 | 1.311 | -1.125 | -1.378 |
| 2018-03-06 | 1.237 | 1.311 | -1.137 | -1.392 |
| 2018-03-07 | 1.237 | 1.311 | -1.147 | -1.399 |
| 2018-03-08 | 1.237 | 1.311 | -1.161 | -1.413 |
| 2018-03-09 | 1.227 | 1.311 | -1.189 | -1.424 |
| 2018-03-12 | 1.227 | 1.311 | -1.207 | -1.443 |
| 2018-03-13 | 1.227 | 1.311 | -1.224 | -1.458 |
| 2018-03-14 | 1.227 | 1.311 | -1.245 | -1.47 |
| 2018-03-15 | 1.228 | 1.311 | -1.278 | -1.481 |
| 2018-03-16 | 1.228 | 1.312 | -1.302 | -1.494 |
| 2018-03-19 | 1.229 | 1.312 | -1.322 | -1.513 |
| 2018-03-20 | 1.229 | 1.311 | -1.348 | -1.531 |
| 2018-03-21 | 1.229 | 1.311 | -1.371 | -1.556 |
| 2018-03-22 | 1.229 | 1.311 | -1.386 | -1.557 |
| 2018-03-23 | 1.229 | 1.31 | -1.392 | -1.546 |
| 2018-03-26 | 1.229 | 1.311 | -1.395 | -1.552 |
| 2018-03-27 | 1.229 | 1.311 | -1.402 | -1.551 |
| 2018-03-28 | 1.229 | 1.311 | -1.408 | -1.539 |
| 2018-03-29 | 1.228 | 1.31 | -1.412 | -1.543 |
| 2018-04-03 | 1.228 | 1.31 | -1.421 | -1.55 |
| 2018-04-04 | 1.228 | 1.31 | -1.425 | -1.561 |
| 2018-04-05 | 1.228 | 1.311 | -1.431 | -1.58 |
| 2018-04-06 | 1.229 | 1.311 | -1.437 | -1.588 |
| 2018-04-09 | 1.229 | 1.311 | -1.437 | -1.584 |
| 2018-04-10 | 1.229 | 1.311 | -1.439 | -1.584 |
| 2018-04-11 | 1.229 | 1.31 | -1.442 | -1.589 |
| 2018-04-12 | 1.229 | 1.311 | -1.448 | -1.597 |
| 2018-04-13 | 1.229 | 1.31 | -1.453 | -1.611 |
| 2018-04-16 | 1.229 | 1.309 | -1.455 | -1.624 |
| 2018-04-17 | 1.228 | 1.319 | -1.455 | -1.616 |
| 2018-04-18 | 1.228 | 1.309 | -1.459 | -1.628 |
| 2018-04-19 | 1.228 | 1.309 | -1.459 | -1.628 |
| 2018-04-20 | 1.228 | 1.309 | -1.459 | -1.628 |
| 2018-04-23 | 1.228 | 1.309 | -1.46 | -1.649 |
| 2018-04-24 | 1.228 | 1.309 | -1.462 | -1.649 |
| 2018-04-25 | 1.228 | 1.309 | -1.466 | -1.652 |
| 2018-04-26 | 1.228 | 1.309 | -1.459 | -1.65 |
| 2018-04-27 | 1.229 | 1.309 | -1.458 | -1.66 |
| 2018-04-30 | 1.229 | 1.309 | -1.463 | -1.65 |
| 2018-05-02 | 1.229 | 1.309 | -1.463 | -1.657 |
| 2018-05-03 | 1.228 | 1.309 | -1.463 | -1.653 |
| 2018-05-04 | 1.228 | 1.31 | -1.469 | -1.657 |
| 2018-05-07 | 1.228 | 1.309 | -1.469 | -1.657 |
| 2018-05-09 | 1.227 | 1.309 | -1.456 | -1.651 |
| 2018-05-10 | 1.226 | 1.309 | -1.455 | -1.648 |
| 2018-05-11 | 1.227 | 1.309 | -1.442 | -1.646 |
| 2018-05-14 | 1.226 | 1.31 | -1.43 | -1.637 |
| 2018-05-15 | 1.226 | 1.308 | -1.421 | -1.634 |
| 2018-05-16 | 1.226 | 1.308 | -1.426 | -1.641 |
| 2018-05-17 | 1.226 | 1.308 | -1.431 | -1.646 |
| 2018-05-18 | 1.226 | 1.309 | -1.429 | -1.645 |
| 2018-05-21 | 1.225 | 1.307 | -1.43 | -1.645 |
| 2018-05-22 | 1.224 | 1.309 | -1.43 | -1.644 |
| 2018-05-23 | 1.223 | 1.309 | -1.43 | -1.634 |
| 2018-05-24 | 1.224 | 1.307 | -1.419 | -1.617 |
| 2018-05-25 | 1.223 | 1.308 | -1.418 | -1.611 |
| 2018-05-28 | 1.222 | 1.306 | -1.418 | -1.611 |
| 2018-05-29 | 1.221 | 1.306 | -1.407 | -1.588 |
| 2018-05-30 | 1.221 | 1.304 | -1.4 | -1.58 |
| 2018-05-31 | 1.221 | 1.304 | -1.421 | -1.598 |
| 2018-06-01 | 1.221 | 1.304 | -1.418 | -1.604 |
| 2018-06-04 | 1.221 | 1.304 | -1.414 | -1.62 |
| 2018-06-05 | 1.222 | 1.302 | -1.419 | -1.619 |
| 2018-06-06 | 1.221 | 1.3 | -1.421 | -1.621 |
| 2018-06-07 | 1.221 | 1.3 | -1.427 | -1.634 |
| 2018-06-08 | 1.221 | 1.3 | -1.426 | -1.62 |
| 2018-06-11 | 1.241 | 1.311 | -1.413 | -1.628 |
| 2018-06-12 | 1.241 | 1.321 | -1.416 | -1.625 |
| 2018-06-13 | 1.241 | 1.321 | -1.421 | -1.627 |
| 2018-06-14 | 1.251 | 1.321 | -1.405 | -1.632 |
| 2018-06-15 | 1.241 | 1.323 | -1.406 | -1.632 |
| 2018-06-18 | 1.253 | 1.334 | -1.395 | -1.622 |
| 2018-06-19 | 1.253 | 1.331 | -1.4 | -1.613 |
| 2018-06-20 | 1.253 | 1.332 | -1.402 | -1.622 |
| 2018-06-21 | 1.253 | 1.332 | -1.405 | -1.62 |
| 2018-06-22 | 1.253 | 1.34 | -1.409 | -1.617 |
| 2018-06-25 | 1.254 | 1.341 | -1.407 | -1.606 |
| 2018-06-26 | 1.253 | 1.341 | -1.406 | -1.611 |
| 2018-06-27 | 1.254 | 1.341 | -1.404 | -1.603 |
| 2018-06-28 | 1.484 | 1.531 | -1.177 | -1.413 |
| 2018-06-29 | 1.481 | 1.531 | -1.176 | -1.414 |
| 2018-07-02 | 1.481 | 1.531 | -1.182 | -1.422 |
| 2018-07-03 | 1.481 | 1.531 | -1.177 | -1.423 |
| 2018-07-04 | 1.491 | 1.541 | -1.167 | -1.413 |
| 2018-07-09 | 1.491 | 1.551 | -1.163 | -1.406 |
| 2018-07-10 | 1.491 | 1.55 | -1.167 | -1.411 |
| 2018-07-11 | 1.501 | 1.559 | -1.157 | -1.398 |
| 2018-07-12 | 1.501 | 1.559 | -1.159 | -1.405 |
| 2018-07-13 | 1.501 | 1.569 | -1.156 | -1.397 |
| 2018-07-16 | 1.501 | 1.569 | -1.153 | -1.398 |
| 2018-07-17 | 1.511 | 1.579 | -1.152 | -1.396 |
| 2018-07-18 | 1.501 | 1.569 | -1.168 | -1.411 |
| 2018-07-19 | 1.511 | 1.569 | -1.157 | -1.417 |
| 2018-07-20 | 1.501 | 1.569 | -1.162 | -1.412 |
| 2018-07-23 | 1.511 | 1.569 | -1.145 | -1.409 |
| 2018-07-24 | 1.511 | 1.579 | -1.145 | -1.408 |
| 2018-07-25 | 1.521 | 1.589 | -1.137 | -1.398 |
| 2018-07-26 | 1.52 | 1.589 | -1.139 | -1.407 |
| 2018-07-27 | 1.52 | 1.589 | -1.142 | -1.411 |
| 2018-07-30 | 1.529 | 1.609 | -1.133 | -1.391 |
| 2018-07-31 | 1.539 | 1.608 | -1.129 | -1.398 |
| 2018-08-01 | 1.549 | 1.627 | -1.118 | -1.382 |
| 2018-08-02 | 1.559 | 1.626 | -1.1 | -1.378 |
| 2018-08-03 | 1.739 | 1.786 | -0.923 | -1.217 |
| 2018-08-06 | 1.759 | 1.816 | -0.903 | -1.187 |
| 2018-08-07 | 1.769 | 1.826 | -0.891 | -1.174 |
| 2018-08-08 | 1.769 | 1.836 | -0.891 | -1.168 |
| 2018-08-09 | 1.779 | 1.843 | -0.878 | -1.158 |
| 2018-08-10 | 1.779 | 1.839 | -0.859 | -1.146 |
| 2018-08-13 | 1.779 | 1.846 | -0.854 | -1.123 |
| 2018-08-14 | 1.779 | 1.846 | -0.855 | -1.134 |
| 2018-08-15 | 1.779 | 1.846 | -0.852 | -1.135 |
| 2018-08-16 | 1.779 | 1.846 | -0.862 | -1.137 |
| 2018-08-17 | 1.789 | 1.847 | -0.842 | -1.133 |
| 2018-08-20 | 1.789 | 1.857 | -0.84 | -1.123 |
| 2018-08-21 | 1.799 | 1.867 | -0.83 | -1.108 |
| 2018-08-22 | 1.799 | 1.877 | -0.832 | -1.098 |
| 2018-08-23 | 1.799 | 1.877 | -0.831 | -1.102 |
| 2018-08-24 | 1.799 | 1.876 | -0.837 | -1.11 |
| 2018-08-27 | 1.809 | 1.876 | -0.827 | -1.11 |
| 2018-08-28 | 1.809 | 1.886 | -0.825 | -1.108 |
| 2018-08-29 | 1.809 | 1.885 | -0.823 | -1.113 |
| 2018-08-30 | 1.809 | 1.896 | -0.831 | -1.112 |
| 2018-08-31 | 1.819 | 1.896 | -0.821 | -1.11 |
| 2018-09-03 | 1.819 | 1.896 | -0.816 | -1.109 |
| 2018-09-04 | 1.819 | 1.906 | -0.823 | -1.103 |
| 2018-09-05 | 1.829 | 1.907 | -0.807 | -1.104 |
| 2018-09-06 | 1.829 | 1.917 | -0.817 | -1.099 |
| 2018-09-07 | 1.829 | 1.907 | -0.821 | -1.106 |
| 2018-09-10 | 1.829 | 1.917 | -0.824 | -1.113 |
| 2018-09-11 | 1.839 | 1.936 | -0.814 | -1.098 |
| 2018-09-12 | 1.849 | 1.946 | -0.802 | -1.085 |
| 2018-09-13 | 1.859 | 1.948 | -0.794 | -1.093 |
| 2018-09-14 | 1.859 | 1.958 | -0.797 | -1.09 |
| 2018-09-17 | 1.859 | 1.959 | -0.799 | -1.089 |
| 2018-09-18 | 1.869 | 1.968 | -0.787 | -1.08 |
| 2018-09-19 | 1.878 | 1.977 | -0.793 | -1.077 |
| 2018-09-20 | 1.879 | 1.978 | -0.806 | -1.087 |
| 2018-09-21 | 1.879 | 1.988 | -0.813 | -1.088 |
| 2018-09-24 | 1.879 | 1.987 | -0.814 | -1.089 |
| 2018-09-25 | 1.889 | 1.985 | -0.811 | -1.092 |
| 2018-09-26 | 1.899 | 1.994 | -0.806 | -1.084 |
| 2018-09-27 | 2.018 | 2.051 | -0.696 | -1.027 |
| 2018-10-01 | 2.037 | 2.058 | -0.678 | -1.026 |
| 2018-10-02 | 2.048 | 2.067 | -0.678 | -1.015 |
| 2018-10-03 | 2.048 | 2.077 | -0.678 | -1.007 |
| 2018-10-04 | 2.058 | 2.089 | -0.67 | -1.027 |
| 2018-10-05 | 2.058 | 2.088 | -0.668 | -1.028 |
| 2018-10-08 | 2.058 | 2.088 | -0.674 | -1.028 |
| 2018-10-09 | 2.068 | 2.086 | -0.67 | -1.032 |
| 2018-10-10 | 2.068 | 2.096 | -0.675 | -1.029 |
| 2018-10-11 | 2.068 | 2.106 | -0.686 | -1.004 |
| 2018-10-12 | 2.068 | 2.117 | -0.686 | -1.003 |
| 2018-10-15 | 2.078 | 2.116 | -0.689 | -1.007 |
| 2018-10-16 | 2.078 | 2.126 | -0.689 | -0.997 |
| 2018-10-17 | 2.078 | 2.126 | -0.69 | -0.996 |
| 2018-10-18 | 2.077 | 2.125 | -0.709 | -1.031 |
| 2018-10-19 | 2.087 | 2.124 | -0.707 | -1.05 |
| 2018-10-22 | 2.087 | 2.121 | -0.717 | -1.061 |
| 2018-10-23 | 2.087 | 2.129 | -0.72 | -1.054 |
| 2018-10-24 | 2.097 | 2.129 | -0.71 | -1.054 |
| 2018-10-25 | 2.097 | 2.119 | -0.71 | -1.064 |
| 2018-10-26 | 2.108 | 2.128 | -0.73 | -1.077 |
| 2018-10-29 | 2.118 | 2.138 | -0.72 | -1.067 |
| 2018-10-30 | 2.118 | 2.138 | -0.72 | -1.067 |
| 2018-10-31 | 2.128 | 2.149 | -0.748 | -1.084 |
| 2018-11-01 | 2.138 | 2.159 | -0.739 | -1.074 |
| 2018-11-02 | 2.278 | 2.288 | -0.632 | -0.965 |
| 2018-11-05 | 2.288 | 2.288 | -0.619 | -0.977 |
| 2018-11-06 | 2.288 | 2.298 | -0.619 | -0.967 |
| 2018-11-07 | 2.287 | 2.309 | -0.631 | -0.965 |
| 2018-11-08 | 2.297 | 2.319 | -0.621 | -0.955 |
| 2018-11-09 | 2.306 | 2.328 | -0.628 | -0.964 |
| 2018-11-12 | 2.306 | 2.328 | -0.624 | -0.955 |
| 2018-11-13 | 2.306 | 2.328 | -0.624 | -0.955 |
| 2018-11-14 | 2.306 | 2.337 | -0.639 | -0.94 |
| 2018-11-15 | 2.316 | 2.347 | -0.64 | -0.918 |
| 2018-11-16 | 2.316 | 2.347 | -0.64 | -0.918 |
| 2018-11-19 | 2.316 | 2.348 | -0.646 | -0.907 |
| 2018-11-20 | 2.326 | 2.358 | -0.643 | -0.887 |
| 2018-11-21 | 2.326 | 2.358 | -0.643 | -0.887 |
| 2018-11-22 | 2.326 | 2.358 | -0.679 | -0.9 |
| 2018-11-23 | 2.336 | 2.367 | -0.671 | -0.901 |
| 2018-11-26 | 2.336 | 2.366 | -0.687 | -0.908 |
| 2018-11-27 | 2.336 | 2.366 | -0.687 | -0.908 |
| 2018-11-28 | 2.336 | 2.366 | -0.687 | -0.908 |
| 2018-11-29 | 2.336 | 2.366 | -0.687 | -0.908 |
| 2018-11-30 | 2.336 | 2.366 | -0.716 | -0.9 |
| 2018-12-03 | 2.326 | 2.353 | -0.741 | -0.928 |
| 2018-12-04 | 2.326 | 2.352 | -0.729 | -0.923 |
| 2018-12-05 | 2.326 | 2.351 | -0.756 | -0.916 |
| 2018-12-06 | 2.325 | 2.35 | -0.757 | -0.902 |
| 2018-12-07 | 2.325 | 2.347 | -0.761 | -0.891 |
| 2018-12-10 | 2.324 | 2.344 | -0.766 | -0.874 |
| 2018-12-11 | 2.322 | 2.341 | -0.769 | -0.88 |
| 2018-12-12 | 2.322 | 2.341 | -0.768 | -0.891 |
| 2018-12-13 | 2.331 | 2.339 | -0.768 | -0.902 |
| 2018-12-14 | 2.331 | 2.338 | -0.781 | -0.888 |
| 2018-12-17 | 2.331 | 2.337 | -0.784 | -0.894 |
| 2018-12-18 | 2.331 | 2.335 | -0.772 | -0.851 |
| 2018-12-19 | 2.329 | 2.334 | -0.77 | -0.843 |
| 2018-12-20 | 2.329 | 2.334 | -0.77 | -0.843 |
| 2018-12-21 | 2.329 | 2.334 | -0.77 | -0.843 |
| 2018-12-27 | 2.319 | 2.319 | -0.793 | -0.832 |
| 2018-12-28 | 2.33 | 2.329 | -0.777 | -0.803 |
| 2018-12-31 | 2.319 | 2.327 | -0.798 | -0.795 |
| 2019-01-02 | 2.319 | 2.317 | -0.798 | -0.805 |
| 2019-01-03 | 2.319 | 2.317 | -0.798 | -0.805 |
| 2019-01-04 | 2.319 | 2.327 | -0.798 | -0.795 |
| 2019-01-07 | 2.32 | 2.329 | -0.787 | -0.785 |
| 2019-01-08 | 2.32 | 2.329 | -0.787 | -0.785 |
| 2019-01-09 | 2.318 | 2.328 | -0.789 | -0.829 |
| 2019-01-10 | 2.318 | 2.328 | -0.787 | -0.809 |
| 2019-01-11 | 2.318 | 2.328 | -0.787 | -0.809 |
| 2019-01-14 | 2.318 | 2.328 | -0.769 | -0.801 |
| 2019-01-15 | 2.318 | 2.328 | -0.769 | -0.801 |
| 2019-01-16 | 2.318 | 2.327 | -0.77 | -0.82 |
| 2019-01-17 | 2.318 | 2.327 | -0.77 | -0.82 |
| 2019-01-18 | 2.318 | 2.336 | -0.751 | -0.81 |
| 2019-01-21 | 2.318 | 2.336 | -0.751 | -0.81 |
| 2019-01-22 | 2.318 | 2.335 | -0.769 | -0.817 |
| 2019-01-23 | 2.318 | 2.336 | -0.761 | -0.815 |
| 2019-01-24 | 2.306 | 2.335 | -0.765 | -0.809 |
| 2019-01-25 | 2.306 | 2.335 | -0.765 | -0.809 |
| 2019-01-28 | 2.307 | 2.332 | -0.751 | -0.81 |
| 2019-01-29 | 2.296 | 2.329 | -0.754 | -0.804 |
| 2019-01-30 | 2.296 | 2.319 | -0.754 | -0.814 |
| 2019-01-31 | 2.298 | 2.319 | -0.747 | -0.773 |
| 2019-02-01 | 2.298 | 2.32 | -0.743 | -0.752 |
| 2019-02-04 | 2.298 | 2.31 | -0.743 | -0.762 |
| 2019-02-05 | 2.298 | 2.31 | -0.743 | -0.762 |
| 2019-02-06 | 2.298 | 2.308 | -0.748 | -0.762 |
| 2019-02-07 | 2.298 | 2.308 | -0.707 | -0.748 |
| 2019-02-08 | 2.298 | 2.309 | -0.708 | -0.736 |
| 2019-02-11 | 2.298 | 2.309 | -0.698 | -0.724 |
| 2019-02-12 | 2.298 | 2.309 | -0.698 | -0.724 |
| 2019-02-13 | 2.308 | 2.298 | -0.684 | -0.726 |
| 2019-02-14 | 2.308 | 2.298 | -0.694 | -0.727 |
| 2019-02-15 | 2.318 | 2.298 | -0.684 | -0.727 |
| 2019-02-18 | 2.328 | 2.298 | -0.624 | -0.717 |
| 2019-02-19 | 2.328 | 2.298 | -0.624 | -0.717 |
| 2019-02-20 | 2.328 | 2.298 | -0.643 | -0.684 |
| 2019-02-21 | 2.33 | 2.298 | -0.631 | -0.699 |
| 2019-02-22 | 2.33 | 2.298 | -0.626 | -0.702 |
| 2019-02-25 | 2.329 | 2.308 | -0.619 | -0.683 |
| 2019-02-26 | 2.329 | 2.308 | -0.619 | -0.683 |
| 2019-02-27 | 2.33 | 2.308 | -0.606 | -0.666 |
| 2019-02-28 | 2.329 | 2.308 | -0.595 | -0.665 |
| 2019-03-01 | 2.339 | 2.308 | -0.585 | -0.665 |
| 2019-03-04 | 2.339 | 2.308 | -0.578 | -0.683 |
| 2019-03-05 | 2.338 | 2.308 | -0.577 | -0.684 |
| 2019-03-06 | 2.338 | 2.308 | -0.577 | -0.684 |
| 2019-03-07 | 2.338 | 2.318 | -0.577 | -0.674 |
| 2019-03-08 | 2.338 | 2.308 | -0.577 | -0.684 |
| 2019-03-11 | 2.338 | 2.308 | -0.578 | -0.669 |
| 2019-03-12 | 2.339 | 2.308 | -0.563 | -0.668 |
| 2019-03-13 | 2.34 | 2.309 | -0.581 | -0.659 |
| 2019-03-14 | 2.339 | 2.309 | -0.585 | -0.646 |
| 2019-03-15 | 2.339 | 2.309 | -0.585 | -0.646 |
| 2019-03-18 | 2.34 | 2.309 | -0.603 | -0.618 |
| 2019-03-19 | 2.34 | 2.309 | -0.603 | -0.618 |
| 2019-03-20 | 2.339 | 2.309 | -0.577 | -0.613 |
| 2019-03-21 | 2.339 | 2.308 | -0.572 | -0.594 |
| 2019-03-22 | 2.339 | 2.308 | -0.58 | -0.587 |
| 2019-03-25 | 2.33 | 2.308 | -0.589 | -0.546 |
| 2019-03-26 | 2.329 | 2.308 | -0.577 | -0.525 |
| 2019-03-27 | 2.329 | 2.309 | -0.581 | -0.483 |
| 2019-03-28 | 2.329 | 2.309 | -0.581 | -0.483 |
| 2019-03-29 | 2.331 | 2.312 | -0.58 | -0.511 |
| 2019-04-01 | 2.33 | 2.312 | -0.575 | -0.53 |
| 2019-04-02 | 2.331 | 2.312 | -0.582 | -0.533 |
| 2019-04-03 | 2.33 | 2.312 | -0.578 | -0.549 |
| 2019-04-04 | 2.33 | 2.312 | -0.569 | -0.536 |
| 2019-04-05 | 2.33 | 2.312 | -0.572 | -0.551 |
| 2019-04-08 | 2.33 | 2.312 | -0.564 | -0.55 |
| 2019-04-09 | 2.33 | 2.312 | -0.561 | -0.554 |
| 2019-04-10 | 2.33 | 2.312 | -0.583 | -0.54 |
| 2019-04-11 | 2.33 | 2.312 | -0.577 | -0.534 |
| 2019-04-12 | 2.33 | 2.322 | -0.581 | -0.538 |
| 2019-04-15 | 2.33 | 2.321 | -0.568 | -0.545 |
| 2019-04-16 | 2.33 | 2.322 | -0.581 | -0.545 |
| 2019-04-17 | 2.331 | 2.322 | -0.571 | -0.552 |
| 2019-04-18 | 2.331 | 2.322 | -0.571 | -0.552 |
| 2019-04-23 | 2.331 | 2.332 | -0.56 | -0.516 |
| 2019-04-24 | 2.332 | 2.332 | -0.566 | -0.505 |
| 2019-04-25 | 2.332 | 2.332 | -0.562 | -0.496 |
| 2019-04-26 | 2.34 | 2.343 | -0.553 | -0.487 |
| 2019-04-29 | 2.351 | 2.344 | -0.539 | -0.483 |
| 2019-04-30 | 2.36 | 2.344 | -0.526 | -0.487 |
| 2019-05-02 | 2.359 | 2.344 | -0.515 | -0.507 |
| 2019-05-03 | 2.509 | 2.454 | -0.36 | -0.406 |
| 2019-05-06 | 2.518 | 2.454 | -0.35 | -0.406 |
| 2019-05-07 | 2.518 | 2.455 | -0.352 | -0.381 |
| 2019-05-09 | 2.518 | 2.455 | -0.352 | -0.381 |
| 2019-05-10 | 2.509 | 2.458 | -0.328 | -0.353 |
| 2019-05-13 | 2.511 | 2.448 | -0.318 | -0.342 |
| 2019-05-14 | 2.511 | 2.451 | -0.324 | -0.309 |
| 2019-05-15 | 2.511 | 2.445 | -0.325 | -0.312 |
| 2019-05-16 | 2.512 | 2.448 | -0.32 | -0.294 |
| 2019-05-17 | 2.512 | 2.448 | -0.32 | -0.294 |
| 2019-05-20 | 2.514 | 2.455 | -0.323 | -0.327 |
| 2019-05-21 | 2.513 | 2.465 | -0.323 | -0.334 |
| 2019-05-22 | 2.511 | 2.465 | -0.325 | -0.346 |
| 2019-05-23 | 2.5 | 2.458 | -0.331 | -0.335 |
| 2019-05-24 | 2.5 | 2.458 | -0.331 | -0.335 |
| 2019-05-27 | 2.5 | 2.458 | -0.331 | -0.335 |
| 2019-05-28 | 2.505 | 2.463 | -0.334 | -0.29 |
| 2019-05-29 | 2.505 | 2.463 | -0.334 | -0.29 |
| 2019-05-30 | 2.512 | 2.478 | -0.312 | -0.2 |
| 2019-05-31 | 2.512 | 2.478 | -0.312 | -0.2 |
| 2019-06-03 | 2.513 | 2.485 | -0.288 | -0.103 |
| 2019-06-04 | 2.502 | 2.477 | -0.294 | -0.105 |
| 2019-06-05 | 2.5 | 2.477 | -0.292 | -0.083 |
| 2019-06-06 | 2.5 | 2.477 | -0.292 | -0.083 |
| 2019-06-07 | 2.499 | 2.475 | -0.271 | -0.046 |
| 2019-06-10 | 2.488 | 2.468 | -0.266 | -0.048 |
| 2019-06-11 | 2.489 | 2.468 | -0.28 | -0.053 |
| 2019-06-12 | 2.488 | 2.463 | -0.258 | -0.043 |
| 2019-06-13 | 2.488 | 2.458 | -0.24 | -0.016 |
| 2019-06-14 | 2.488 | 2.461 | -0.232 | 0.043 |
| 2019-06-17 | 2.49 | 2.467 | -0.248 | 0.003 |
| 2019-06-18 | 2.492 | 2.474 | -0.217 | 0.026 |
| 2019-06-19 | 2.506 | 2.498 | -0.216 | -0.008 |
| 2019-06-20 | 2.508 | 2.501 | -0.173 | 0.128 |
| 2019-06-21 | 2.514 | 2.502 | -0.179 | 0.088 |
| 2019-06-24 | 2.513 | 2.5 | -0.163 | 0.111 |
| 2019-06-25 | 2.515 | 2.5 | -0.141 | 0.143 |
| 2019-06-26 | 2.515 | 2.5 | -0.141 | 0.143 |
| 2019-06-27 | 2.514 | 2.503 | -0.149 | 0.105 |
| 2019-06-28 | 2.515 | 2.504 | -0.15 | 0.112 |
| 2019-07-01 | 2.516 | 2.507 | -0.162 | 0.088 |
| 2019-07-02 | 2.521 | 2.523 | -0.143 | 0.087 |
| 2019-07-03 | 2.523 | 2.533 | -0.119 | 0.11 |
| 2019-07-04 | 2.524 | 2.548 | -0.133 | 0.111 |
| 2019-07-08 | 2.526 | 2.548 | -0.168 | 0.029 |
| 2019-07-09 | 2.528 | 2.538 | -0.171 | 0.007 |
| 2019-07-10 | 2.528 | 2.533 | -0.17 | -0.006 |
| 2019-07-11 | 2.534 | 2.557 | -0.133 | 0.087 |
| 2019-07-12 | 2.533 | 2.56 | -0.152 | 0.049 |
| 2019-07-15 | 2.523 | 2.567 | -0.143 | 0.07 |
| 2019-07-16 | 2.523 | 2.567 | -0.143 | 0.07 |
| 2019-07-17 | 2.529 | 2.578 | -0.143 | 0.063 |
| 2019-07-18 | 2.53 | 2.583 | -0.118 | 0.088 |
| 2019-07-19 | 2.535 | 2.588 | -0.099 | 0.122 |
| 2019-07-22 | 2.534 | 2.587 | -0.123 | 0.092 |
| 2019-07-23 | 2.533 | 2.591 | -0.115 | 0.089 |
| 2019-07-24 | 2.536 | 2.601 | -0.107 | 0.101 |
| 2019-07-25 | 2.536 | 2.601 | -0.107 | 0.101 |
| 2019-07-26 | 2.528 | 2.584 | -0.106 | 0.073 |
| 2019-07-29 | 2.527 | 2.584 | -0.095 | 0.072 |
| 2019-07-30 | 2.534 | 2.571 | -0.093 | 0.082 |
| 2019-07-31 | 2.535 | 2.573 | -0.106 | 0.081 |
| 2019-08-01 | 2.537 | 2.57 | -0.127 | 0.031 |
| 2019-08-02 | 2.54 | 2.564 | -0.079 | 0.144 |
| 2019-08-05 | 2.534 | 2.558 | -0.059 | 0.213 |
| 2019-08-06 | 2.539 | 2.569 | -0.037 | 0.256 |
| 2019-08-07 | 2.54 | 2.562 | -0.034 | 0.263 |
| 2019-08-08 | 2.538 | 2.579 | -0.041 | 0.247 |
| 2019-08-09 | 2.544 | 2.573 | -0.036 | 0.242 |
| 2019-08-12 | 2.54 | 2.582 | -0.035 | 0.239 |
| 2019-08-13 | 2.542 | 2.577 | -0.018 | 0.25 |
| 2019-08-14 | 2.546 | 2.56 | -0.028 | 0.181 |
| 2019-08-15 | 2.544 | 2.563 | 0.016 | 0.277 |
| 2019-08-16 | 2.56 | 2.585 | 0.004 | 0.255 |
| 2019-08-19 | 2.562 | 2.608 | -0.011 | 0.257 |
| 2019-08-20 | 2.561 | 2.605 | -0.01 | 0.262 |
| 2019-08-21 | 2.563 | 2.609 | -0.008 | 0.256 |
| 2019-08-22 | 2.558 | 2.586 | 0.008 | 0.227 |
| 2019-08-23 | 2.552 | 2.558 | -0.004 | 0.172 |
| 2019-08-26 | 2.552 | 2.558 | -0.004 | 0.172 |
| 2019-08-27 | 2.558 | 2.569 | 0.023 | 0.251 |
| 2019-08-28 | 2.558 | 2.569 | 0.023 | 0.251 |
| 2019-08-29 | 2.558 | 2.569 | 0.023 | 0.251 |
| 2019-08-30 | 2.558 | 2.569 | 0.023 | 0.251 |
| 2019-09-02 | 2.558 | 2.569 | 0.023 | 0.251 |
| 2019-09-03 | 2.558 | 2.569 | 0.023 | 0.251 |
| 2019-09-04 | 2.583 | 2.579 | 0.028 | 0.303 |
| 2019-09-05 | 2.583 | 2.579 | 0.028 | 0.303 |
| 2019-09-06 | 2.577 | 2.558 | 0.006 | 0.251 |
| 2019-09-09 | 2.573 | 2.56 | 0.002 | 0.251 |
| 2019-09-10 | 2.575 | 2.57 | 0.008 | 0.23 |
| 2019-09-11 | 2.57 | 2.573 | 0.013 | 0.191 |
| 2019-09-12 | 2.57 | 2.573 | 0.013 | 0.191 |
| 2019-09-13 | 2.54 | 2.525 | 0.001 | 0.151 |
| 2019-09-16 | 2.534 | 2.509 | -0.005 | 0.13 |
| 2019-09-17 | 2.534 | 2.509 | -0.005 | 0.13 |
| 2019-09-18 | 2.536 | 2.506 | -0.016 | 0.136 |
| 2019-09-19 | 2.536 | 2.506 | -0.016 | 0.136 |
| 2019-09-20 | 2.536 | 2.506 | -0.016 | 0.136 |
| 2019-09-23 | 2.54 | 2.502 | 0.034 | 0.167 |
| 2019-09-24 | 2.54 | 2.502 | 0.034 | 0.167 |
| 2019-09-25 | 2.54 | 2.502 | 0.034 | 0.167 |
| 2019-09-26 | 2.563 | 2.544 | 0.046 | 0.2 |
| 2019-09-27 | 2.572 | 2.555 | 0.061 | 0.187 |
| 2019-09-30 | 2.578 | 2.57 | 0.075 | 0.208 |
| 2019-10-01 | 2.588 | 2.58 | 0.071 | 0.215 |
| 2019-10-02 | 2.585 | 2.583 | 0.104 | 0.302 |
| 2019-10-03 | 2.595 | 2.588 | 0.127 | 0.346 |
| 2019-10-04 | 2.593 | 2.586 | 0.143 | 0.397 |
| 2019-10-07 | 2.593 | 2.596 | 0.158 | 0.392 |
| 2019-10-08 | 2.587 | 2.6 | 0.16 | 0.381 |
| 2019-10-09 | 2.588 | 2.603 | 0.186 | 0.388 |
| 2019-10-10 | 2.588 | 2.596 | 0.184 | 0.374 |
| 2019-10-11 | 2.588 | 2.573 | 0.169 | 0.314 |
| 2019-10-14 | 2.586 | 2.581 | 0.169 | 0.307 |
| 2019-10-15 | 2.588 | 2.583 | 0.168 | 0.306 |
| 2019-10-16 | 2.59 | 2.589 | 0.177 | 0.298 |
| 2019-10-17 | 2.59 | 2.584 | 0.214 | 0.297 |
| 2019-10-18 | 2.587 | 2.588 | 0.227 | 0.303 |
| 2019-10-21 | 2.588 | 2.584 | 0.246 | 0.329 |
| 2019-10-22 | 2.584 | 2.574 | 0.244 | 0.323 |
| 2019-10-23 | 2.582 | 2.578 | 0.24 | 0.347 |
| 2019-10-24 | 2.584 | 2.568 | 0.244 | 0.319 |
| 2019-10-25 | 2.593 | 2.573 | 0.252 | 0.324 |
| 2019-10-29 | 2.585 | 2.56 | 0.253 | 0.291 |
| 2019-10-30 | 2.581 | 2.556 | 0.271 | 0.3 |
| 2019-10-31 | 2.574 | 2.553 | 0.278 | 0.325 |
| 2019-11-01 | 2.569 | 2.551 | 0.279 | 0.345 |
| 2019-11-04 | 2.578 | 2.556 | 0.272 | 0.32 |
| 2019-11-05 | 2.583 | 2.558 | 0.287 | 0.313 |
| 2019-11-06 | 2.586 | 2.549 | 0.276 | 0.303 |
| 2019-11-07 | 2.58 | 2.55 | 0.279 | 0.297 |
| 2019-11-08 | 2.585 | 2.552 | 0.289 | 0.29 |
| 2019-11-11 | 2.574 | 2.553 | 0.275 | 0.296 |
| 2019-11-12 | 2.578 | 2.545 | 0.271 | 0.284 |
| 2019-11-13 | 2.582 | 2.551 | 0.27 | 0.303 |
| 2019-11-14 | 2.569 | 2.546 | 0.266 | 0.309 |
| 2019-11-15 | 2.574 | 2.549 | 0.267 | 0.319 |
| 2019-11-18 | 2.583 | 2.557 | 0.282 | 0.337 |
| 2019-11-19 | 2.588 | 2.561 | 0.285 | 0.348 |
| 2019-11-20 | 2.586 | 2.553 | 0.281 | 0.371 |
| 2019-11-21 | 2.588 | 2.56 | 0.271 | 0.371 |
| 2019-11-22 | 2.583 | 2.557 | 0.263 | 0.365 |
| 2019-11-25 | 2.584 | 2.56 | 0.261 | 0.338 |
| 2019-11-26 | 2.579 | 2.559 | 0.271 | 0.338 |
| 2019-11-27 | 2.58 | 2.558 | 0.266 | 0.34 |
| 2019-11-28 | 2.577 | 2.563 | 0.273 | 0.33 |
| 2019-11-29 | 2.581 | 2.553 | 0.275 | 0.328 |
| 2019-12-02 | 2.58 | 2.55 | 0.28 | 0.318 |
| 2019-12-03 | 2.577 | 2.533 | 0.289 | 0.333 |
| 2019-12-04 | 2.573 | 2.527 | 0.293 | 0.343 |
| 2019-12-05 | 2.575 | 2.529 | 0.295 | 0.337 |
| 2019-12-06 | 2.573 | 2.529 | 0.29 | 0.337 |
| 2019-12-09 | 2.572 | 2.537 | 0.292 | 0.325 |
| 2019-12-10 | 2.573 | 2.529 | 0.293 | 0.327 |
| 2019-12-11 | 2.573 | 2.532 | 0.293 | 0.317 |
| 2019-12-12 | 2.575 | 2.526 | 0.286 | 0.327 |
| 2019-12-13 | 2.58 | 2.533 | 0.28 | 0.306 |
| 2019-12-16 | 2.576 | 2.532 | 0.282 | 0.31 |
| 2019-12-17 | 2.58 | 2.533 | 0.278 | 0.302 |
| 2019-12-18 | 2.583 | 2.539 | 0.272 | 0.3 |
| 2019-12-19 | 2.578 | 2.532 | 0.252 | 0.272 |
| 2019-12-20 | 2.568 | 2.523 | 0.245 | 0.27 |
| 2019-12-23 | 2.579 | 2.52 | 0.233 | 0.268 |
| 2019-12-27 | 2.57 | 2.517 | 0.235 | 0.266 |
| 2019-12-30 | 2.568 | 2.51 | 0.271 | 0.269 |
| 2019-12-31 | 2.563 | 2.519 | 0.272 | 0.274 |
| 2020-01-02 | 2.559 | 2.518 | 0.28 | 0.275 |
| 2020-01-03 | 2.554 | 2.508 | 0.296 | 0.306 |
| 2020-01-06 | 2.555 | 2.518 | 0.298 | 0.315 |
| 2020-01-07 | 2.557 | 2.518 | 0.292 | 0.316 |
| 2020-01-08 | 2.56 | 2.521 | 0.336 | 0.319 |
| 2020-01-09 | 2.563 | 2.53 | 0.322 | 0.301 |
| 2020-01-10 | 2.565 | 2.523 | 0.332 | 0.303 |
| 2020-01-13 | 2.559 | 2.516 | 0.339 | 0.308 |
| 2020-01-14 | 2.561 | 2.523 | 0.327 | 0.317 |
| 2020-01-15 | 2.563 | 2.532 | 0.334 | 0.327 |
| 2020-01-16 | 2.563 | 2.531 | 0.343 | 0.35 |
| 2020-01-17 | 2.561 | 2.522 | 0.351 | 0.357 |
| 2020-01-20 | 2.562 | 2.524 | 0.368 | 0.355 |
| 2020-01-21 | 2.562 | 2.523 | 0.364 | 0.362 |
| 2020-01-22 | 2.56 | 2.522 | 0.369 | 0.361 |
| 2020-01-23 | 2.556 | 2.527 | 0.376 | 0.386 |
| 2020-01-24 | 2.556 | 2.538 | 0.375 | 0.4 |
| 2020-01-27 | 2.568 | 2.53 | 0.395 | 0.433 |
| 2020-01-28 | 2.571 | 2.54 | 0.4 | 0.439 |
| 2020-01-29 | 2.569 | 2.539 | 0.393 | 0.423 |
| 2020-01-30 | 2.558 | 2.548 | 0.397 | 0.448 |
| 2020-01-31 | 2.553 | 2.554 | 0.409 | 0.463 |
| 2020-02-03 | 2.553 | 2.56 | 0.419 | 0.501 |
| 2020-02-04 | 2.556 | 2.558 | 0.423 | 0.467 |
| 2020-02-05 | 2.56 | 2.548 | 0.418 | 0.439 |
| 2020-02-06 | 2.559 | 2.54 | 0.426 | 0.427 |
| 2020-02-07 | 2.79 | 2.749 | 0.659 | 0.645 |
| 2020-02-10 | 2.787 | 2.739 | 0.677 | 0.669 |
| 2020-02-11 | 2.799 | 2.736 | 0.683 | 0.653 |
| 2020-02-12 | 2.803 | 2.738 | 0.686 | 0.637 |
| 2020-02-13 | 2.801 | 2.737 | 0.698 | 0.648 |
| 2020-02-14 | 2.803 | 2.743 | 0.698 | 0.652 |
| 2020-02-17 | 2.803 | 2.744 | 0.697 | 0.657 |
| 2020-02-18 | 2.793 | 2.742 | 0.695 | 0.678 |
| 2020-02-19 | 2.792 | 2.738 | 0.694 | 0.681 |
| 2020-02-20 | 2.8 | 2.744 | 0.707 | 0.688 |
| 2020-02-21 | 2.805 | 2.737 | 0.711 | 0.721 |
| 2020-02-24 | 2.804 | 2.734 | 0.743 | 0.815 |
| 2020-02-25 | 2.807 | 2.745 | 0.752 | 0.804 |
| 2020-02-26 | 2.813 | 2.756 | 0.777 | 0.84 |
| 2020-02-27 | 2.815 | 2.753 | 0.81 | 0.913 |
| 2020-02-28 | 2.804 | 2.741 | 0.917 | 1.049 |
| 2020-03-02 | 2.804 | 2.737 | 1.116 | 1.256 |
| 2020-03-03 | 2.813 | 2.742 | 1.036 | 1.134 |
| 2020-03-04 | 2.808 | 2.729 | 1.339 | 1.402 |
| 2020-03-05 | 2.809 | 2.732 | 1.341 | 1.426 |
| 2020-03-06 | 2.813 | 2.718 | 1.444 | 1.524 |
| 2020-03-09 | 2.808 | 2.712 | 1.572 | 1.616 |
| 2020-03-10 | 2.822 | 2.718 | 1.556 | 1.568 |
| 2020-03-11 | 2.803 | 2.699 | 1.558 | 1.613 |
| 2020-03-12 | 2.809 | 2.708 | 1.58 | 1.58 |
| 2020-03-13 | 2.738 | 2.627 | 1.467 | 1.518 |
| 2020-03-16 | 2.72 | 2.598 | 1.421 | 1.511 |
| 2020-03-17 | 2.238 | 2.113 | 0.778 | 0.988 |
| 2020-03-18 | 2.208 | 2.053 | 0.684 | 0.911 |
| 2020-03-19 | 2.183 | 1.991 | 0.595 | 0.848 |
| 2020-03-20 | 2.151 | 1.956 | 0.576 | 0.836 |
| 2020-03-23 | 2.129 | 1.941 | 0.544 | 0.813 |
| 2020-03-24 | 2.113 | 1.909 | 0.508 | 0.763 |
| 2020-03-25 | 2.089 | 1.886 | 0.453 | 0.722 |
| 2020-03-26 | 2.059 | 1.828 | 0.335 | 0.707 |
| 2020-03-27 | 1.433 | 1.263 | -0.37 | 0.142 |
| 2020-03-30 | 1.393 | 1.203 | -0.393 | 0.026 |
| 2020-03-31 | 1.393 | 1.171 | -0.42 | 0.002 |
| 2020-04-01 | 1.363 | 1.148 | -0.417 | -0.022 |
| 2020-04-02 | 1.356 | 1.133 | -0.353 | -0.08 |
| 2020-04-03 | 1.351 | 1.119 | -0.377 | -0.08 |
| 2020-04-06 | 1.328 | 1.104 | -0.342 | -0.073 |
| 2020-04-07 | 1.303 | 1.092 | -0.31 | -0.075 |
| 2020-04-08 | 1.254 | 1.06 | -0.311 | -0.083 |
| 2020-04-09 | 1.22 | 1.057 | -0.219 | -0.081 |
| 2020-04-14 | 1.228 | 1.045 | -0.196 | -0.086 |
| 2020-04-15 | 1.23 | 1.04 | -0.155 | -0.084 |
| 2020-04-16 | 1.194 | 1.018 | -0.165 | -0.061 |
| 2020-04-17 | 1.213 | 1.015 | -0.139 | -0.072 |
| 2020-04-20 | 1.216 | 1.001 | -0.128 | -0.072 |
| 2020-04-21 | 1.193 | 0.968 | -0.083 | -0.097 |
| 2020-04-22 | 1.14 | 0.933 | -0.07 | -0.09 |
| 2020-04-23 | 1.091 | 0.946 | -0.061 | -0.08 |
| 2020-04-24 | 1.102 | 0.953 | 0.023 | -0.07 |
| 2020-04-27 | 1.123 | 0.979 | 0.059 | -0.055 |
| 2020-04-28 | 1.132 | 0.984 | 0.14 | -0.04 |
| 2020-04-29 | 1.161 | 0.991 | 0.213 | -0.039 |
| 2020-04-30 | 1.173 | 0.978 | 0.344 | -0.005 |
| 2020-05-04 | 1.186 | 0.968 | 0.399 | 0.031 |
| 2020-05-05 | 1.197 | 0.958 | 0.426 | 0.019 |
| 2020-05-06 | 1.156 | 0.918 | 0.442 | 0.032 |
| 2020-05-07 | 1.128 | 0.898 | 0.435 | 0.037 |
| 2020-05-11 | 0.608 | 0.515 | -0.084 | -0.336 |
| 2020-05-12 | 0.595 | 0.493 | -0.074 | -0.349 |
| 2020-05-13 | 0.603 | 0.478 | -0.042 | -0.359 |
| 2020-05-14 | 0.612 | 0.488 | -0.036 | -0.352 |
| 2020-05-15 | 0.606 | 0.488 | -0.04 | -0.345 |
| 2020-05-18 | 0.616 | 0.494 | -0.037 | -0.308 |
| 2020-05-19 | 0.599 | 0.485 | -0.034 | -0.312 |
| 2020-05-20 | 0.62 | 0.468 | -0.018 | -0.296 |
| 2020-05-21 | 0.622 | 0.488 | -0.019 | -0.275 |
| 2020-05-22 | 0.619 | 0.513 | -0.029 | -0.262 |
| 2020-05-25 | 0.615 | 0.503 | -0.029 | -0.262 |
| 2020-05-26 | 0.604 | 0.498 | -0.041 | -0.26 |
| 2020-05-27 | 0.62 | 0.496 | -0.022 | -0.26 |
| 2020-05-28 | 0.63 | 0.508 | -0.01 | -0.247 |
| 2020-05-29 | 0.647 | 0.515 | -0.004 | -0.244 |
| 2020-06-01 | 0.665 | 0.533 | 0.003 | -0.207 |
| 2020-06-02 | 0.67 | 0.537 | 0.01 | -0.195 |
| 2020-06-03 | 0.682 | 0.535 | 0.013 | -0.193 |
| 2020-06-04 | 0.692 | 0.542 | 0.022 | -0.198 |
| 2020-06-05 | 0.693 | 0.55 | 0.027 | -0.204 |
| 2020-06-08 | 0.705 | 0.55 | 0.03 | -0.2 |
| 2020-06-09 | 0.704 | 0.563 | 0.025 | -0.203 |
| 2020-06-10 | 0.691 | 0.548 | 0.022 | -0.215 |
| 2020-06-11 | 0.698 | 0.548 | 0.027 | -0.175 |
| 2020-06-12 | 0.706 | 0.554 | 0.019 | -0.163 |
| 2020-06-15 | 0.695 | 0.565 | 0.041 | -0.161 |
| 2020-06-16 | 0.712 | 0.565 | 0.032 | -0.156 |
| 2020-06-17 | 0.736 | 0.56 | 0.024 | -0.154 |
| 2020-06-18 | 0.729 | 0.577 | 0.034 | -0.147 |
| 2020-06-19 | 0.747 | 0.599 | 0.035 | -0.146 |
| 2020-06-22 | 0.74 | 0.609 | 0.043 | -0.144 |
| 2020-06-23 | 0.749 | 0.618 | 0.043 | -0.135 |
| 2020-06-24 | 0.738 | 0.614 | 0.056 | -0.134 |
| 2020-06-25 | 0.742 | 0.618 | 0.034 | -0.14 |
| 2020-06-26 | 0.743 | 0.629 | 0.032 | -0.136 |
| 2020-06-29 | 0.753 | 0.635 | 0.044 | -0.126 |
| 2020-06-30 | 0.762 | 0.655 | 0.038 | -0.116 |
| 2020-07-01 | 0.757 | 0.663 | 0.042 | -0.103 |
| 2020-07-02 | 0.769 | 0.667 | 0.036 | -0.109 |
| 2020-07-03 | 0.775 | 0.668 | 0.064 | -0.076 |
| 2020-07-07 | 0.776 | 0.688 | 0.072 | -0.062 |
| 2020-07-08 | 0.773 | 0.693 | 0.067 | -0.058 |
| 2020-07-09 | 0.778 | 0.693 | 0.074 | -0.054 |
| 2020-07-10 | 0.78 | 0.714 | 0.072 | -0.05 |
| 2020-07-13 | 0.775 | 0.71 | 0.065 | -0.051 |
| 2020-07-14 | 0.773 | 0.701 | 0.069 | -0.051 |
| 2020-07-15 | 0.783 | 0.703 | 0.067 | -0.047 |
| 2020-07-16 | 0.789 | 0.712 | 0.068 | -0.045 |
| 2020-07-17 | 0.783 | 0.72 | 0.069 | -0.04 |
| 2020-07-20 | 0.783 | 0.709 | 0.082 | -0.039 |
| 2020-07-21 | 0.792 | 0.71 | 0.085 | -0.034 |
| 2020-07-22 | 0.794 | 0.713 | 0.077 | -0.033 |
| 2020-07-23 | 0.793 | 0.716 | 0.096 | -0.032 |
| 2020-07-24 | 0.788 | 0.722 | 0.093 | -0.03 |
| 2020-07-27 | 0.797 | 0.718 | 0.07 | -0.027 |
| 2020-07-28 | 0.794 | 0.737 | 0.072 | -0.031 |
| 2020-07-29 | 0.798 | 0.753 | 0.079 | -0.031 |
| 2020-07-30 | 0.801 | 0.758 | 0.089 | -0.027 |
| 2020-07-31 | 0.803 | 0.763 | 0.091 | -0.019 |
| 2020-08-03 | 0.809 | 0.766 | 0.091 | -0.017 |
| 2020-08-04 | 0.812 | 0.768 | 0.092 | -0.021 |
| 2020-08-05 | 0.807 | 0.774 | 0.098 | -0.014 |
| 2020-08-06 | 0.814 | 0.77 | 0.097 | -0.016 |
| 2020-08-07 | 0.818 | 0.78 | 0.088 | -0.019 |
| 2020-08-10 | 0.818 | 0.78 | 0.083 | -0.025 |
| 2020-08-11 | 0.822 | 0.786 | 0.087 | -0.028 |
| 2020-08-12 | 0.826 | 0.783 | 0.075 | -0.028 |
| 2020-08-13 | 0.821 | 0.781 | 0.06 | -0.029 |
| 2020-08-14 | 0.822 | 0.783 | 0.07 | -0.031 |
| 2020-08-17 | 0.82 | 0.785 | 0.072 | -0.03 |
| 2020-08-18 | 0.823 | 0.795 | 0.087 | -0.017 |
| 2020-08-19 | 0.828 | 0.796 | 0.093 | -0.015 |
| 2020-08-20 | 0.831 | 0.802 | 0.084 | -0.011 |
| 2020-08-21 | 0.827 | 0.806 | 0.09 | -0.011 |
| 2020-08-24 | 0.828 | 0.807 | 0.106 | -0.009 |
| 2020-08-25 | 0.821 | 0.803 | 0.089 | -0.01 |
| 2020-08-26 | 0.816 | 0.796 | 0.084 | -0.016 |
| 2020-08-27 | 0.817 | 0.794 | 0.094 | -0.012 |
| 2020-08-28 | 0.817 | 0.799 | 0.099 | -0.015 |
| 2020-08-31 | 0.817 | 0.813 | 0.099 | -0.015 |
| 2020-09-01 | 0.818 | 0.803 | 0.089 | -0.003 |
| 2020-09-02 | 0.818 | 0.819 | 0.089 | 0.005 |
| 2020-09-03 | 0.82 | 0.824 | 0.091 | 0.004 |
| 2020-09-04 | 0.823 | 0.831 | 0.092 | 0.009 |
| 2020-09-07 | 0.827 | 0.831 | 0.098 | 0.009 |
| 2020-09-08 | 0.828 | 0.832 | 0.091 | 0.003 |
| 2020-09-09 | 0.833 | 0.838 | 0.09 | 0.015 |
| 2020-09-10 | 0.828 | 0.831 | 0.091 | 0.016 |
| 2020-09-11 | 0.824 | 0.825 | 0.09 | 0.016 |
| 2020-09-14 | 0.824 | 0.843 | 0.103 | 0.037 |
| 2020-09-15 | 0.825 | 0.855 | 0.094 | 0.054 |
| 2020-09-16 | 0.827 | 0.859 | 0.107 | 0.062 |
| 2020-09-17 | 0.841 | 0.863 | 0.113 | 0.064 |
| 2020-09-18 | 0.844 | 0.869 | 0.115 | 0.066 |
| 2020-09-21 | 0.848 | 0.873 | 0.117 | 0.062 |
| 2020-09-22 | 0.848 | 0.878 | 0.118 | 0.064 |
| 2020-09-23 | 0.838 | 0.871 | 0.115 | 0.068 |
| 2020-09-24 | 0.833 | 0.873 | 0.107 | 0.068 |
| 2020-09-25 | 0.838 | 0.873 | 0.122 | 0.071 |
| 2020-09-29 | 0.844 | 0.87 | 0.125 | 0.081 |
| 2020-09-30 | 0.848 | 0.883 | 0.116 | 0.08 |
| 2020-10-01 | 0.848 | 0.882 | 0.116 | 0.08 |
| 2020-10-02 | 0.855 | 0.889 | 0.116 | 0.083 |
| 2020-10-05 | 0.859 | 0.898 | 0.13 | 0.091 |
| 2020-10-06 | 0.855 | 0.9 | 0.12 | 0.096 |
| 2020-10-07 | 0.858 | 0.903 | 0.12 | 0.092 |
| 2020-10-08 | 0.856 | 0.895 | 0.129 | 0.091 |
| 2020-10-09 | 0.859 | 0.903 | 0.126 | 0.092 |
| 2020-10-12 | 0.861 | 0.898 | 0.121 | 0.082 |
| 2020-10-13 | 0.858 | 0.897 | 0.113 | 0.085 |
| 2020-10-14 | 0.861 | 0.898 | 0.12 | 0.086 |
| 2020-10-15 | 0.857 | 0.902 | 0.132 | 0.082 |
| 2020-10-16 | 0.859 | 0.898 | 0.132 | 0.095 |
| 2020-10-19 | 0.859 | 0.9 | 0.141 | 0.09 |
| 2020-10-20 | 0.857 | 0.903 | 0.134 | 0.093 |
| 2020-10-21 | 0.857 | 0.901 | 0.141 | 0.095 |
| 2020-10-22 | 0.861 | 0.897 | 0.135 | 0.095 |
| 2020-10-23 | 0.862 | 0.894 | 0.133 | 0.093 |
| 2020-10-26 | 0.859 | 0.893 | 0.128 | 0.098 |
| 2020-10-27 | 0.86 | 0.885 | 0.137 | 0.088 |
| 2020-10-29 | 0.865 | 0.902 | 0.136 | 0.089 |
| 2020-10-30 | 0.873 | 0.909 | 0.134 | 0.09 |